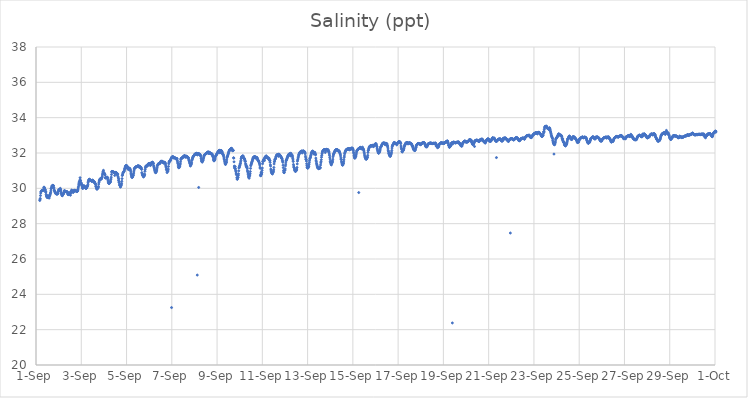
| Category | Salinity (ppt) |
|---|---|
| 44440.166666666664 | 29.31 |
| 44440.177083333336 | 29.37 |
| 44440.1875 | 29.43 |
| 44440.197916666664 | 29.59 |
| 44440.208333333336 | 29.73 |
| 44440.21875 | 29.8 |
| 44440.229166666664 | 29.83 |
| 44440.239583333336 | 29.84 |
| 44440.25 | 29.87 |
| 44440.260416666664 | 29.88 |
| 44440.270833333336 | 29.88 |
| 44440.28125 | 29.88 |
| 44440.291666666664 | 29.88 |
| 44440.302083333336 | 29.88 |
| 44440.3125 | 29.89 |
| 44440.322916666664 | 29.9 |
| 44440.333333333336 | 29.93 |
| 44440.34375 | 30.03 |
| 44440.354166666664 | 30.07 |
| 44440.364583333336 | 30.01 |
| 44440.375 | 30.03 |
| 44440.385416666664 | 29.94 |
| 44440.395833333336 | 29.92 |
| 44440.40625 | 29.93 |
| 44440.416666666664 | 29.85 |
| 44440.427083333336 | 29.78 |
| 44440.4375 | 29.8 |
| 44440.447916666664 | 29.66 |
| 44440.458333333336 | 29.57 |
| 44440.46875 | 29.56 |
| 44440.479166666664 | 29.59 |
| 44440.489583333336 | 29.49 |
| 44440.5 | 29.48 |
| 44440.510416666664 | 29.49 |
| 44440.520833333336 | 29.54 |
| 44440.53125 | 29.58 |
| 44440.541666666664 | 29.54 |
| 44440.552083333336 | 29.5 |
| 44440.5625 | 29.47 |
| 44440.572916666664 | 29.55 |
| 44440.583333333336 | 29.45 |
| 44440.59375 | 29.55 |
| 44440.604166666664 | 29.6 |
| 44440.614583333336 | 29.62 |
| 44440.625 | 29.66 |
| 44440.635416666664 | 29.72 |
| 44440.645833333336 | 29.76 |
| 44440.65625 | 29.85 |
| 44440.666666666664 | 29.97 |
| 44440.677083333336 | 29.99 |
| 44440.6875 | 30.04 |
| 44440.697916666664 | 30.12 |
| 44440.708333333336 | 30.13 |
| 44440.71875 | 30.13 |
| 44440.729166666664 | 30.14 |
| 44440.739583333336 | 30.17 |
| 44440.75 | 30.16 |
| 44440.760416666664 | 30.16 |
| 44440.770833333336 | 30.15 |
| 44440.78125 | 30.06 |
| 44440.791666666664 | 30.02 |
| 44440.802083333336 | 29.9 |
| 44440.8125 | 29.89 |
| 44440.822916666664 | 29.84 |
| 44440.833333333336 | 29.82 |
| 44440.84375 | 29.78 |
| 44440.854166666664 | 29.75 |
| 44440.864583333336 | 29.71 |
| 44440.875 | 29.72 |
| 44440.885416666664 | 29.71 |
| 44440.895833333336 | 29.68 |
| 44440.90625 | 29.69 |
| 44440.916666666664 | 29.68 |
| 44440.927083333336 | 29.72 |
| 44440.9375 | 29.68 |
| 44440.947916666664 | 29.68 |
| 44440.958333333336 | 29.7 |
| 44440.96875 | 29.73 |
| 44440.979166666664 | 29.84 |
| 44440.989583333336 | 29.82 |
| 44441.0 | 29.93 |
| 44441.010416666664 | 29.89 |
| 44441.020833333336 | 29.89 |
| 44441.03125 | 29.92 |
| 44441.041666666664 | 29.91 |
| 44441.052083333336 | 29.88 |
| 44441.0625 | 29.94 |
| 44441.072916666664 | 30 |
| 44441.083333333336 | 29.94 |
| 44441.09375 | 29.91 |
| 44441.104166666664 | 29.81 |
| 44441.114583333336 | 29.73 |
| 44441.125 | 29.69 |
| 44441.135416666664 | 29.67 |
| 44441.145833333336 | 29.61 |
| 44441.15625 | 29.58 |
| 44441.166666666664 | 29.59 |
| 44441.177083333336 | 29.62 |
| 44441.1875 | 29.66 |
| 44441.197916666664 | 29.67 |
| 44441.208333333336 | 29.68 |
| 44441.21875 | 29.71 |
| 44441.229166666664 | 29.75 |
| 44441.239583333336 | 29.77 |
| 44441.25 | 29.87 |
| 44441.260416666664 | 29.83 |
| 44441.270833333336 | 29.86 |
| 44441.28125 | 29.82 |
| 44441.291666666664 | 29.82 |
| 44441.302083333336 | 29.83 |
| 44441.3125 | 29.83 |
| 44441.322916666664 | 29.82 |
| 44441.333333333336 | 29.8 |
| 44441.34375 | 29.81 |
| 44441.354166666664 | 29.79 |
| 44441.364583333336 | 29.79 |
| 44441.375 | 29.81 |
| 44441.385416666664 | 29.8 |
| 44441.395833333336 | 29.76 |
| 44441.40625 | 29.68 |
| 44441.416666666664 | 29.65 |
| 44441.427083333336 | 29.65 |
| 44441.4375 | 29.71 |
| 44441.447916666664 | 29.65 |
| 44441.458333333336 | 29.66 |
| 44441.46875 | 29.67 |
| 44441.479166666664 | 29.7 |
| 44441.489583333336 | 29.76 |
| 44441.5 | 29.66 |
| 44441.510416666664 | 29.71 |
| 44441.520833333336 | 29.61 |
| 44441.53125 | 29.75 |
| 44441.541666666664 | 29.76 |
| 44441.552083333336 | 29.8 |
| 44441.5625 | 29.86 |
| 44441.572916666664 | 29.9 |
| 44441.583333333336 | 29.87 |
| 44441.59375 | 29.85 |
| 44441.604166666664 | 29.85 |
| 44441.614583333336 | 29.82 |
| 44441.625 | 29.81 |
| 44441.635416666664 | 29.78 |
| 44441.645833333336 | 29.77 |
| 44441.65625 | 29.81 |
| 44441.666666666664 | 29.84 |
| 44441.677083333336 | 29.86 |
| 44441.6875 | 29.89 |
| 44441.697916666664 | 29.88 |
| 44441.708333333336 | 29.85 |
| 44441.71875 | 29.88 |
| 44441.729166666664 | 29.88 |
| 44441.739583333336 | 29.87 |
| 44441.75 | 29.85 |
| 44441.760416666664 | 8.81 |
| 44441.770833333336 | 29.86 |
| 44441.78125 | 29.85 |
| 44441.791666666664 | 29.83 |
| 44441.802083333336 | 29.82 |
| 44441.8125 | 29.83 |
| 44441.822916666664 | 29.83 |
| 44441.833333333336 | 29.84 |
| 44441.84375 | 29.88 |
| 44441.854166666664 | 29.94 |
| 44441.864583333336 | 30.02 |
| 44441.875 | 30.09 |
| 44441.885416666664 | 30.19 |
| 44441.895833333336 | 30.26 |
| 44441.90625 | 30.34 |
| 44441.916666666664 | 30.39 |
| 44441.927083333336 | 30.21 |
| 44441.9375 | 30.47 |
| 44441.947916666664 | 30.6 |
| 44441.958333333336 | 30.44 |
| 44441.96875 | 30.44 |
| 44441.979166666664 | 30.33 |
| 44441.989583333336 | 30.28 |
| 44442.0 | 30.3 |
| 44442.010416666664 | 30.23 |
| 44442.020833333336 | 30.21 |
| 44442.03125 | 30.16 |
| 44442.041666666664 | 30.11 |
| 44442.052083333336 | 30.04 |
| 44442.0625 | 29.99 |
| 44442.072916666664 | 30.01 |
| 44442.083333333336 | 30.04 |
| 44442.09375 | 30.12 |
| 44442.104166666664 | 30.15 |
| 44442.114583333336 | 30.07 |
| 44442.125 | 30.1 |
| 44442.135416666664 | 30.13 |
| 44442.145833333336 | 30.12 |
| 44442.15625 | 30.08 |
| 44442.166666666664 | 30.08 |
| 44442.177083333336 | 30.05 |
| 44442.1875 | 30.03 |
| 44442.197916666664 | 30.01 |
| 44442.208333333336 | 29.99 |
| 44442.21875 | 30.01 |
| 44442.229166666664 | 30.02 |
| 44442.239583333336 | 30.03 |
| 44442.25 | 30.07 |
| 44442.260416666664 | 30.1 |
| 44442.270833333336 | 30.13 |
| 44442.28125 | 30.15 |
| 44442.291666666664 | 30.22 |
| 44442.302083333336 | 30.32 |
| 44442.3125 | 30.39 |
| 44442.322916666664 | 30.44 |
| 44442.333333333336 | 30.47 |
| 44442.34375 | 30.5 |
| 44442.354166666664 | 30.51 |
| 44442.364583333336 | 30.51 |
| 44442.375 | 30.49 |
| 44442.385416666664 | 30.47 |
| 44442.395833333336 | 30.46 |
| 44442.40625 | 30.45 |
| 44442.416666666664 | 30.45 |
| 44442.427083333336 | 30.44 |
| 44442.4375 | 30.44 |
| 44442.447916666664 | 30.42 |
| 44442.458333333336 | 30.4 |
| 44442.46875 | 30.41 |
| 44442.479166666664 | 30.41 |
| 44442.489583333336 | 30.41 |
| 44442.5 | 30.47 |
| 44442.510416666664 | 30.42 |
| 44442.520833333336 | 30.42 |
| 44442.53125 | 30.42 |
| 44442.541666666664 | 30.42 |
| 44442.552083333336 | 30.39 |
| 44442.5625 | 30.34 |
| 44442.572916666664 | 30.37 |
| 44442.583333333336 | 30.36 |
| 44442.59375 | 30.33 |
| 44442.604166666664 | 30.28 |
| 44442.614583333336 | 30.27 |
| 44442.625 | 30.26 |
| 44442.635416666664 | 30.2 |
| 44442.645833333336 | 30.11 |
| 44442.65625 | 30.1 |
| 44442.666666666664 | 30.04 |
| 44442.677083333336 | 30 |
| 44442.6875 | 29.96 |
| 44442.697916666664 | 29.95 |
| 44442.708333333336 | 29.99 |
| 44442.71875 | 30.03 |
| 44442.729166666664 | 30.01 |
| 44442.739583333336 | 30.02 |
| 44442.75 | 30.06 |
| 44442.760416666664 | 30.11 |
| 44442.770833333336 | 30.24 |
| 44442.78125 | 30.33 |
| 44442.791666666664 | 30.41 |
| 44442.802083333336 | 30.45 |
| 44442.8125 | 30.47 |
| 44442.822916666664 | 30.49 |
| 44442.833333333336 | 30.54 |
| 44442.84375 | 30.53 |
| 44442.854166666664 | 30.54 |
| 44442.864583333336 | 30.53 |
| 44442.875 | 30.52 |
| 44442.885416666664 | 30.54 |
| 44442.895833333336 | 30.55 |
| 44442.90625 | 30.59 |
| 44442.916666666664 | 30.62 |
| 44442.927083333336 | 30.69 |
| 44442.9375 | 30.78 |
| 44442.947916666664 | 30.85 |
| 44442.958333333336 | 30.92 |
| 44442.96875 | 30.96 |
| 44442.979166666664 | 31.02 |
| 44442.989583333336 | 30.86 |
| 44443.0 | 30.87 |
| 44443.010416666664 | 30.86 |
| 44443.020833333336 | 30.83 |
| 44443.03125 | 30.83 |
| 44443.041666666664 | 30.78 |
| 44443.052083333336 | 30.75 |
| 44443.0625 | 30.6 |
| 44443.072916666664 | 30.58 |
| 44443.083333333336 | 30.62 |
| 44443.09375 | 30.61 |
| 44443.104166666664 | 30.59 |
| 44443.114583333336 | 30.61 |
| 44443.125 | 30.59 |
| 44443.135416666664 | 30.61 |
| 44443.145833333336 | 30.6 |
| 44443.15625 | 30.63 |
| 44443.166666666664 | 30.57 |
| 44443.177083333336 | 30.47 |
| 44443.1875 | 30.41 |
| 44443.197916666664 | 30.34 |
| 44443.208333333336 | 30.3 |
| 44443.21875 | 30.29 |
| 44443.229166666664 | 30.27 |
| 44443.239583333336 | 30.28 |
| 44443.25 | 30.33 |
| 44443.260416666664 | 30.38 |
| 44443.270833333336 | 30.34 |
| 44443.28125 | 30.35 |
| 44443.291666666664 | 30.38 |
| 44443.302083333336 | 30.48 |
| 44443.3125 | 30.53 |
| 44443.322916666664 | 30.63 |
| 44443.333333333336 | 30.78 |
| 44443.34375 | 30.92 |
| 44443.354166666664 | 30.96 |
| 44443.364583333336 | 30.95 |
| 44443.375 | 30.95 |
| 44443.385416666664 | 30.94 |
| 44443.395833333336 | 30.93 |
| 44443.40625 | 30.93 |
| 44443.416666666664 | 30.92 |
| 44443.427083333336 | 30.92 |
| 44443.4375 | 30.91 |
| 44443.447916666664 | 30.9 |
| 44443.458333333336 | 30.9 |
| 44443.46875 | 30.89 |
| 44443.479166666664 | 30.73 |
| 44443.489583333336 | 30.85 |
| 44443.5 | 30.86 |
| 44443.510416666664 | 30.89 |
| 44443.520833333336 | 30.87 |
| 44443.53125 | 30.91 |
| 44443.541666666664 | 30.89 |
| 44443.552083333336 | 30.86 |
| 44443.5625 | 30.86 |
| 44443.572916666664 | 30.83 |
| 44443.583333333336 | 30.82 |
| 44443.59375 | 30.76 |
| 44443.604166666664 | 30.77 |
| 44443.614583333336 | 30.81 |
| 44443.625 | 30.66 |
| 44443.635416666664 | 30.59 |
| 44443.645833333336 | 30.45 |
| 44443.65625 | 30.53 |
| 44443.666666666664 | 30.34 |
| 44443.677083333336 | 30.37 |
| 44443.6875 | 30.24 |
| 44443.697916666664 | 30.16 |
| 44443.708333333336 | 30.19 |
| 44443.71875 | 30.17 |
| 44443.729166666664 | 30.07 |
| 44443.739583333336 | 30.1 |
| 44443.75 | 30.16 |
| 44443.760416666664 | 30.16 |
| 44443.770833333336 | 30.22 |
| 44443.78125 | 30.28 |
| 44443.791666666664 | 30.4 |
| 44443.802083333336 | 30.55 |
| 44443.8125 | 30.72 |
| 44443.822916666664 | 30.76 |
| 44443.833333333336 | 30.82 |
| 44443.84375 | 30.87 |
| 44443.854166666664 | 30.9 |
| 44443.864583333336 | 30.92 |
| 44443.875 | 30.94 |
| 44443.885416666664 | 30.94 |
| 44443.895833333336 | 30.98 |
| 44443.90625 | 31.03 |
| 44443.916666666664 | 31.1 |
| 44443.927083333336 | 31.12 |
| 44443.9375 | 31.17 |
| 44443.947916666664 | 31.22 |
| 44443.958333333336 | 31.26 |
| 44443.96875 | 31.27 |
| 44443.979166666664 | 31.29 |
| 44443.989583333336 | 31.28 |
| 44444.0 | 31.29 |
| 44444.010416666664 | 31.28 |
| 44444.020833333336 | 31.15 |
| 44444.03125 | 31.19 |
| 44444.041666666664 | 31.13 |
| 44444.052083333336 | 31.17 |
| 44444.0625 | 31.2 |
| 44444.072916666664 | 31.17 |
| 44444.083333333336 | 31.06 |
| 44444.09375 | 31.11 |
| 44444.104166666664 | 31.1 |
| 44444.114583333336 | 31.1 |
| 44444.125 | 31.12 |
| 44444.135416666664 | 31.14 |
| 44444.145833333336 | 31.09 |
| 44444.15625 | 31.1 |
| 44444.166666666664 | 31.06 |
| 44444.177083333336 | 31 |
| 44444.1875 | 30.93 |
| 44444.197916666664 | 30.83 |
| 44444.208333333336 | 30.77 |
| 44444.21875 | 30.71 |
| 44444.229166666664 | 30.66 |
| 44444.239583333336 | 30.62 |
| 44444.25 | 30.62 |
| 44444.260416666664 | 30.63 |
| 44444.270833333336 | 30.68 |
| 44444.28125 | 30.74 |
| 44444.291666666664 | 30.72 |
| 44444.302083333336 | 30.76 |
| 44444.3125 | 30.85 |
| 44444.322916666664 | 30.93 |
| 44444.333333333336 | 31.03 |
| 44444.34375 | 31.11 |
| 44444.354166666664 | 31.13 |
| 44444.364583333336 | 31.14 |
| 44444.375 | 31.16 |
| 44444.385416666664 | 31.18 |
| 44444.395833333336 | 31.19 |
| 44444.40625 | 31.21 |
| 44444.416666666664 | 31.21 |
| 44444.427083333336 | 31.22 |
| 44444.4375 | 31.23 |
| 44444.447916666664 | 31.23 |
| 44444.458333333336 | 31.23 |
| 44444.46875 | 31.24 |
| 44444.479166666664 | 31.25 |
| 44444.489583333336 | 31.25 |
| 44444.5 | 31.27 |
| 44444.510416666664 | 31.28 |
| 44444.520833333336 | 31.26 |
| 44444.53125 | 31.26 |
| 44444.541666666664 | 31.21 |
| 44444.552083333336 | 31.23 |
| 44444.5625 | 31.26 |
| 44444.572916666664 | 31.21 |
| 44444.583333333336 | 31.21 |
| 44444.59375 | 31.24 |
| 44444.604166666664 | 31.19 |
| 44444.614583333336 | 31.15 |
| 44444.625 | 31.19 |
| 44444.635416666664 | 31.19 |
| 44444.645833333336 | 31.16 |
| 44444.65625 | 31.11 |
| 44444.666666666664 | 31.07 |
| 44444.677083333336 | 30.89 |
| 44444.6875 | 30.82 |
| 44444.697916666664 | 30.81 |
| 44444.708333333336 | 30.74 |
| 44444.71875 | 30.74 |
| 44444.729166666664 | 30.7 |
| 44444.739583333336 | 30.69 |
| 44444.75 | 30.64 |
| 44444.760416666664 | 30.72 |
| 44444.770833333336 | 30.77 |
| 44444.78125 | 30.7 |
| 44444.791666666664 | 30.72 |
| 44444.802083333336 | 30.8 |
| 44444.8125 | 30.96 |
| 44444.822916666664 | 31.06 |
| 44444.833333333336 | 31.16 |
| 44444.84375 | 31.21 |
| 44444.854166666664 | 31.25 |
| 44444.864583333336 | 31.27 |
| 44444.875 | 31.26 |
| 44444.885416666664 | 31.27 |
| 44444.895833333336 | 31.25 |
| 44444.90625 | 31.27 |
| 44444.916666666664 | 31.27 |
| 44444.927083333336 | 31.29 |
| 44444.9375 | 31.32 |
| 44444.947916666664 | 31.35 |
| 44444.958333333336 | 31.38 |
| 44444.96875 | 31.39 |
| 44444.979166666664 | 31.39 |
| 44444.989583333336 | 31.39 |
| 44445.0 | 31.39 |
| 44445.010416666664 | 31.39 |
| 44445.020833333336 | 31.4 |
| 44445.03125 | 31.41 |
| 44445.041666666664 | 31.36 |
| 44445.052083333336 | 31.29 |
| 44445.0625 | 31.34 |
| 44445.072916666664 | 31.34 |
| 44445.083333333336 | 31.4 |
| 44445.09375 | 31.45 |
| 44445.104166666664 | 31.45 |
| 44445.114583333336 | 31.46 |
| 44445.125 | 31.46 |
| 44445.135416666664 | 31.47 |
| 44445.145833333336 | 31.48 |
| 44445.15625 | 31.46 |
| 44445.166666666664 | 31.45 |
| 44445.177083333336 | 31.4 |
| 44445.1875 | 31.39 |
| 44445.197916666664 | 31.28 |
| 44445.208333333336 | 31.24 |
| 44445.21875 | 31.17 |
| 44445.229166666664 | 31.14 |
| 44445.239583333336 | 31.06 |
| 44445.25 | 31.01 |
| 44445.260416666664 | 30.96 |
| 44445.270833333336 | 30.91 |
| 44445.28125 | 30.89 |
| 44445.291666666664 | 30.89 |
| 44445.302083333336 | 30.91 |
| 44445.3125 | 30.99 |
| 44445.322916666664 | 30.97 |
| 44445.333333333336 | 31.03 |
| 44445.34375 | 31.1 |
| 44445.354166666664 | 31.2 |
| 44445.364583333336 | 31.29 |
| 44445.375 | 31.31 |
| 44445.385416666664 | 31.33 |
| 44445.395833333336 | 31.37 |
| 44445.40625 | 31.38 |
| 44445.416666666664 | 31.4 |
| 44445.427083333336 | 31.4 |
| 44445.4375 | 31.4 |
| 44445.447916666664 | 31.4 |
| 44445.458333333336 | 31.4 |
| 44445.46875 | 31.41 |
| 44445.479166666664 | 31.43 |
| 44445.489583333336 | 31.46 |
| 44445.5 | 31.48 |
| 44445.510416666664 | 31.51 |
| 44445.520833333336 | 31.53 |
| 44445.53125 | 31.54 |
| 44445.541666666664 | 31.52 |
| 44445.552083333336 | 31.51 |
| 44445.5625 | 31.49 |
| 44445.572916666664 | 31.53 |
| 44445.583333333336 | 31.52 |
| 44445.59375 | 31.52 |
| 44445.604166666664 | 31.49 |
| 44445.614583333336 | 31.46 |
| 44445.625 | 31.46 |
| 44445.635416666664 | 31.46 |
| 44445.645833333336 | 31.43 |
| 44445.65625 | 31.43 |
| 44445.666666666664 | 31.45 |
| 44445.677083333336 | 31.47 |
| 44445.6875 | 31.47 |
| 44445.697916666664 | 31.45 |
| 44445.708333333336 | 31.43 |
| 44445.71875 | 31.39 |
| 44445.729166666664 | 31.31 |
| 44445.739583333336 | 31.24 |
| 44445.75 | 31.19 |
| 44445.760416666664 | 31.07 |
| 44445.770833333336 | 31.1 |
| 44445.78125 | 30.99 |
| 44445.791666666664 | 30.89 |
| 44445.802083333336 | 31 |
| 44445.8125 | 30.97 |
| 44445.822916666664 | 30.96 |
| 44445.833333333336 | 31.03 |
| 44445.84375 | 31.09 |
| 44445.854166666664 | 31.24 |
| 44445.864583333336 | 31.39 |
| 44445.875 | 31.47 |
| 44445.885416666664 | 31.5 |
| 44445.895833333336 | 31.52 |
| 44445.90625 | 31.54 |
| 44445.916666666664 | 31.57 |
| 44445.927083333336 | 31.57 |
| 44445.9375 | 31.57 |
| 44445.947916666664 | 31.59 |
| 44445.958333333336 | 31.65 |
| 44445.96875 | 31.69 |
| 44445.979166666664 | 31.72 |
| 44445.989583333336 | 23.25 |
| 44446.0 | 31.76 |
| 44446.010416666664 | 31.77 |
| 44446.020833333336 | 31.78 |
| 44446.03125 | 31.78 |
| 44446.041666666664 | 31.79 |
| 44446.052083333336 | 31.78 |
| 44446.0625 | 31.79 |
| 44446.072916666664 | 31.73 |
| 44446.083333333336 | 31.73 |
| 44446.09375 | 31.75 |
| 44446.104166666664 | 31.75 |
| 44446.114583333336 | 31.74 |
| 44446.125 | 31.74 |
| 44446.135416666664 | 31.72 |
| 44446.145833333336 | 31.72 |
| 44446.15625 | 31.7 |
| 44446.166666666664 | 31.69 |
| 44446.177083333336 | 31.69 |
| 44446.1875 | 31.67 |
| 44446.197916666664 | 31.66 |
| 44446.208333333336 | 31.69 |
| 44446.21875 | 31.68 |
| 44446.229166666664 | 31.69 |
| 44446.239583333336 | 31.6 |
| 44446.25 | 31.54 |
| 44446.260416666664 | 31.45 |
| 44446.270833333336 | 31.4 |
| 44446.28125 | 31.32 |
| 44446.291666666664 | 31.23 |
| 44446.302083333336 | 31.17 |
| 44446.3125 | 31.17 |
| 44446.322916666664 | 31.17 |
| 44446.333333333336 | 31.3 |
| 44446.34375 | 31.23 |
| 44446.354166666664 | 31.26 |
| 44446.364583333336 | 31.33 |
| 44446.375 | 31.39 |
| 44446.385416666664 | 31.5 |
| 44446.395833333336 | 31.62 |
| 44446.40625 | 31.67 |
| 44446.416666666664 | 31.69 |
| 44446.427083333336 | 31.7 |
| 44446.4375 | 31.71 |
| 44446.447916666664 | 31.72 |
| 44446.458333333336 | 31.73 |
| 44446.46875 | 31.73 |
| 44446.479166666664 | 31.74 |
| 44446.489583333336 | 31.76 |
| 44446.5 | 31.78 |
| 44446.510416666664 | 31.8 |
| 44446.520833333336 | 31.81 |
| 44446.53125 | 31.82 |
| 44446.541666666664 | 31.83 |
| 44446.552083333336 | 31.83 |
| 44446.5625 | 31.84 |
| 44446.572916666664 | 31.84 |
| 44446.583333333336 | 31.84 |
| 44446.59375 | 31.76 |
| 44446.604166666664 | 31.79 |
| 44446.614583333336 | 31.81 |
| 44446.625 | 31.8 |
| 44446.635416666664 | 31.82 |
| 44446.645833333336 | 31.81 |
| 44446.65625 | 31.77 |
| 44446.666666666664 | 31.8 |
| 44446.677083333336 | 31.77 |
| 44446.6875 | 31.78 |
| 44446.697916666664 | 31.77 |
| 44446.708333333336 | 31.74 |
| 44446.71875 | 31.74 |
| 44446.729166666664 | 31.74 |
| 44446.739583333336 | 31.7 |
| 44446.75 | 31.62 |
| 44446.760416666664 | 31.58 |
| 44446.770833333336 | 31.54 |
| 44446.78125 | 31.49 |
| 44446.791666666664 | 31.43 |
| 44446.802083333336 | 31.39 |
| 44446.8125 | 31.32 |
| 44446.822916666664 | 31.26 |
| 44446.833333333336 | 31.33 |
| 44446.84375 | 31.4 |
| 44446.854166666664 | 31.33 |
| 44446.864583333336 | 31.38 |
| 44446.875 | 31.45 |
| 44446.885416666664 | 31.57 |
| 44446.895833333336 | 31.63 |
| 44446.90625 | 31.66 |
| 44446.916666666664 | 31.71 |
| 44446.927083333336 | 31.74 |
| 44446.9375 | 31.78 |
| 44446.947916666664 | 31.8 |
| 44446.958333333336 | 31.82 |
| 44446.96875 | 31.84 |
| 44446.979166666664 | 31.86 |
| 44446.989583333336 | 31.87 |
| 44447.0 | 31.87 |
| 44447.010416666664 | 31.93 |
| 44447.020833333336 | 31.93 |
| 44447.03125 | 31.93 |
| 44447.041666666664 | 31.94 |
| 44447.052083333336 | 31.95 |
| 44447.0625 | 31.95 |
| 44447.072916666664 | 31.97 |
| 44447.083333333336 | 31.98 |
| 44447.09375 | 31.98 |
| 44447.104166666664 | 31.93 |
| 44447.114583333336 | 31.92 |
| 44447.125 | 25.09 |
| 44447.135416666664 | 31.89 |
| 44447.145833333336 | 31.95 |
| 44447.15625 | 31.98 |
| 44447.166666666664 | 31.97 |
| 44447.177083333336 | 31.96 |
| 44447.1875 | 30.05 |
| 44447.197916666664 | 31.94 |
| 44447.208333333336 | 31.96 |
| 44447.21875 | 31.92 |
| 44447.229166666664 | 31.91 |
| 44447.239583333336 | 31.93 |
| 44447.25 | 31.91 |
| 44447.260416666664 | 31.87 |
| 44447.270833333336 | 31.85 |
| 44447.28125 | 31.82 |
| 44447.291666666664 | 31.71 |
| 44447.302083333336 | 31.66 |
| 44447.3125 | 31.57 |
| 44447.322916666664 | 31.53 |
| 44447.333333333336 | 31.52 |
| 44447.34375 | 31.48 |
| 44447.354166666664 | 31.56 |
| 44447.364583333336 | 31.58 |
| 44447.375 | 31.56 |
| 44447.385416666664 | 31.61 |
| 44447.395833333336 | 31.68 |
| 44447.40625 | 31.74 |
| 44447.416666666664 | 31.8 |
| 44447.427083333336 | 31.85 |
| 44447.4375 | 31.87 |
| 44447.447916666664 | 31.9 |
| 44447.458333333336 | 31.91 |
| 44447.46875 | 31.92 |
| 44447.479166666664 | 31.93 |
| 44447.489583333336 | 31.94 |
| 44447.5 | 31.95 |
| 44447.510416666664 | 31.96 |
| 44447.520833333336 | 31.98 |
| 44447.53125 | 31.99 |
| 44447.541666666664 | 32 |
| 44447.552083333336 | 32.01 |
| 44447.5625 | 32.01 |
| 44447.572916666664 | 32.02 |
| 44447.583333333336 | 32.02 |
| 44447.59375 | 32.06 |
| 44447.604166666664 | 32.06 |
| 44447.614583333336 | 32.05 |
| 44447.625 | 31.98 |
| 44447.635416666664 | 31.98 |
| 44447.645833333336 | 32.03 |
| 44447.65625 | 32.04 |
| 44447.666666666664 | 32.01 |
| 44447.677083333336 | 32 |
| 44447.6875 | 31.98 |
| 44447.697916666664 | 32.02 |
| 44447.708333333336 | 31.97 |
| 44447.71875 | 31.97 |
| 44447.729166666664 | 31.97 |
| 44447.739583333336 | 31.94 |
| 44447.75 | 31.95 |
| 44447.760416666664 | 31.96 |
| 44447.770833333336 | 31.95 |
| 44447.78125 | 31.93 |
| 44447.791666666664 | 31.9 |
| 44447.802083333336 | 31.85 |
| 44447.8125 | 31.8 |
| 44447.822916666664 | 31.78 |
| 44447.833333333336 | 31.72 |
| 44447.84375 | 31.62 |
| 44447.854166666664 | 31.6 |
| 44447.864583333336 | 31.55 |
| 44447.875 | 31.6 |
| 44447.885416666664 | 31.6 |
| 44447.895833333336 | 31.6 |
| 44447.90625 | 31.64 |
| 44447.916666666664 | 31.71 |
| 44447.927083333336 | 31.79 |
| 44447.9375 | 31.83 |
| 44447.947916666664 | 31.85 |
| 44447.958333333336 | 31.88 |
| 44447.96875 | 31.9 |
| 44447.979166666664 | 31.92 |
| 44447.989583333336 | 31.94 |
| 44448.0 | 31.96 |
| 44448.010416666664 | 31.98 |
| 44448.020833333336 | 32.01 |
| 44448.03125 | 32.04 |
| 44448.041666666664 | 32.07 |
| 44448.052083333336 | 32.08 |
| 44448.0625 | 32.1 |
| 44448.072916666664 | 32.13 |
| 44448.083333333336 | 32.12 |
| 44448.09375 | 32.15 |
| 44448.104166666664 | 32.14 |
| 44448.114583333336 | 32.15 |
| 44448.125 | 32.01 |
| 44448.135416666664 | 32.06 |
| 44448.145833333336 | 32.04 |
| 44448.15625 | 32.12 |
| 44448.166666666664 | 32.14 |
| 44448.177083333336 | 32.14 |
| 44448.1875 | 32.12 |
| 44448.197916666664 | 32.13 |
| 44448.208333333336 | 32.1 |
| 44448.21875 | 32.07 |
| 44448.229166666664 | 32.03 |
| 44448.239583333336 | 31.96 |
| 44448.25 | 31.95 |
| 44448.260416666664 | 31.92 |
| 44448.270833333336 | 31.89 |
| 44448.28125 | 31.87 |
| 44448.291666666664 | 31.8 |
| 44448.302083333336 | 31.72 |
| 44448.3125 | 31.66 |
| 44448.322916666664 | 31.62 |
| 44448.333333333336 | 31.54 |
| 44448.34375 | 31.48 |
| 44448.354166666664 | 31.41 |
| 44448.364583333336 | 31.37 |
| 44448.375 | 31.35 |
| 44448.385416666664 | 31.42 |
| 44448.395833333336 | 31.46 |
| 44448.40625 | 31.45 |
| 44448.416666666664 | 31.5 |
| 44448.427083333336 | 31.61 |
| 44448.4375 | 31.73 |
| 44448.447916666664 | 31.78 |
| 44448.458333333336 | 31.81 |
| 44448.46875 | 31.84 |
| 44448.479166666664 | 31.89 |
| 44448.489583333336 | 31.93 |
| 44448.5 | 31.98 |
| 44448.510416666664 | 32.02 |
| 44448.520833333336 | 32.07 |
| 44448.53125 | 32.1 |
| 44448.541666666664 | 32.13 |
| 44448.552083333336 | 32.16 |
| 44448.5625 | 32.18 |
| 44448.572916666664 | 32.19 |
| 44448.583333333336 | 32.2 |
| 44448.59375 | 32.22 |
| 44448.604166666664 | 32.23 |
| 44448.614583333336 | 32.25 |
| 44448.625 | 32.26 |
| 44448.635416666664 | 32.26 |
| 44448.645833333336 | 32.26 |
| 44448.65625 | 32.23 |
| 44448.666666666664 | 32.15 |
| 44448.677083333336 | 32.16 |
| 44448.6875 | 32.13 |
| 44448.697916666664 | 32.14 |
| 44448.708333333336 | 32.16 |
| 44448.71875 | 32.14 |
| 44448.729166666664 | 31.73 |
| 44448.739583333336 | 31.71 |
| 44448.75 | 31.5 |
| 44448.760416666664 | 31.26 |
| 44448.770833333336 | 31.2 |
| 44448.78125 | 31.14 |
| 44448.791666666664 | 31.14 |
| 44448.802083333336 | 31.23 |
| 44448.8125 | 31.1 |
| 44448.822916666664 | 31 |
| 44448.833333333336 | 30.94 |
| 44448.84375 | 30.86 |
| 44448.854166666664 | 30.79 |
| 44448.864583333336 | 30.76 |
| 44448.875 | 30.61 |
| 44448.885416666664 | 30.53 |
| 44448.895833333336 | 30.51 |
| 44448.90625 | 30.59 |
| 44448.916666666664 | 30.61 |
| 44448.927083333336 | 30.63 |
| 44448.9375 | 30.73 |
| 44448.947916666664 | 30.82 |
| 44448.958333333336 | 30.99 |
| 44448.96875 | 31.15 |
| 44448.979166666664 | 31.18 |
| 44448.989583333336 | 31.23 |
| 44449.0 | 31.29 |
| 44449.010416666664 | 31.32 |
| 44449.020833333336 | 31.38 |
| 44449.03125 | 31.41 |
| 44449.041666666664 | 31.5 |
| 44449.052083333336 | 31.58 |
| 44449.0625 | 31.68 |
| 44449.072916666664 | 31.72 |
| 44449.083333333336 | 31.77 |
| 44449.09375 | 31.8 |
| 44449.104166666664 | 31.8 |
| 44449.114583333336 | 31.82 |
| 44449.125 | 31.82 |
| 44449.135416666664 | 31.82 |
| 44449.145833333336 | 31.83 |
| 44449.15625 | 31.82 |
| 44449.166666666664 | 31.74 |
| 44449.177083333336 | 31.73 |
| 44449.1875 | 31.7 |
| 44449.197916666664 | 31.68 |
| 44449.208333333336 | 31.68 |
| 44449.21875 | 31.63 |
| 44449.229166666664 | 31.58 |
| 44449.239583333336 | 31.53 |
| 44449.25 | 31.52 |
| 44449.260416666664 | 31.4 |
| 44449.270833333336 | 31.34 |
| 44449.28125 | 31.29 |
| 44449.291666666664 | 31.23 |
| 44449.302083333336 | 31.22 |
| 44449.3125 | 31.24 |
| 44449.322916666664 | 31.18 |
| 44449.333333333336 | 31.11 |
| 44449.34375 | 31 |
| 44449.354166666664 | 30.94 |
| 44449.364583333336 | 30.87 |
| 44449.375 | 30.79 |
| 44449.385416666664 | 30.7 |
| 44449.395833333336 | 30.64 |
| 44449.40625 | 30.62 |
| 44449.416666666664 | 30.57 |
| 44449.427083333336 | 30.75 |
| 44449.4375 | 30.69 |
| 44449.447916666664 | 30.75 |
| 44449.458333333336 | 30.83 |
| 44449.46875 | 30.95 |
| 44449.479166666664 | 31.13 |
| 44449.489583333336 | 31.28 |
| 44449.5 | 31.33 |
| 44449.510416666664 | 31.37 |
| 44449.520833333336 | 31.42 |
| 44449.53125 | 31.46 |
| 44449.541666666664 | 31.51 |
| 44449.552083333336 | 31.54 |
| 44449.5625 | 31.59 |
| 44449.572916666664 | 31.64 |
| 44449.583333333336 | 31.69 |
| 44449.59375 | 31.72 |
| 44449.604166666664 | 31.74 |
| 44449.614583333336 | 31.76 |
| 44449.625 | 31.77 |
| 44449.635416666664 | 31.78 |
| 44449.645833333336 | 31.78 |
| 44449.65625 | 31.79 |
| 44449.666666666664 | 31.79 |
| 44449.677083333336 | 31.8 |
| 44449.6875 | 31.71 |
| 44449.697916666664 | 31.73 |
| 44449.708333333336 | 31.76 |
| 44449.71875 | 31.75 |
| 44449.729166666664 | 31.75 |
| 44449.739583333336 | 31.75 |
| 44449.75 | 31.73 |
| 44449.760416666664 | 31.75 |
| 44449.770833333336 | 31.72 |
| 44449.78125 | 31.68 |
| 44449.791666666664 | 31.64 |
| 44449.802083333336 | 31.59 |
| 44449.8125 | 31.59 |
| 44449.822916666664 | 31.56 |
| 44449.833333333336 | 31.54 |
| 44449.84375 | 31.55 |
| 44449.854166666664 | 31.49 |
| 44449.864583333336 | 31.45 |
| 44449.875 | 31.39 |
| 44449.885416666664 | 31.32 |
| 44449.895833333336 | 31.2 |
| 44449.90625 | 31.13 |
| 44449.916666666664 | 30.72 |
| 44449.927083333336 | 30.78 |
| 44449.9375 | 30.71 |
| 44449.947916666664 | 30.91 |
| 44449.958333333336 | 30.84 |
| 44449.96875 | 30.8 |
| 44449.979166666664 | 30.89 |
| 44449.989583333336 | 31.02 |
| 44450.0 | 31.15 |
| 44450.010416666664 | 31.39 |
| 44450.020833333336 | 31.51 |
| 44450.03125 | 31.53 |
| 44450.041666666664 | 31.58 |
| 44450.052083333336 | 31.6 |
| 44450.0625 | 31.62 |
| 44450.072916666664 | 31.65 |
| 44450.083333333336 | 31.67 |
| 44450.09375 | 31.57 |
| 44450.104166666664 | 31.71 |
| 44450.114583333336 | 31.75 |
| 44450.125 | 31.77 |
| 44450.135416666664 | 31.78 |
| 44450.145833333336 | 31.8 |
| 44450.15625 | 31.81 |
| 44450.166666666664 | 31.83 |
| 44450.177083333336 | 31.83 |
| 44450.1875 | 31.76 |
| 44450.197916666664 | 31.75 |
| 44450.208333333336 | 31.76 |
| 44450.21875 | 31.76 |
| 44450.229166666664 | 31.74 |
| 44450.239583333336 | 31.73 |
| 44450.25 | 31.69 |
| 44450.260416666664 | 31.72 |
| 44450.270833333336 | 31.71 |
| 44450.28125 | 31.68 |
| 44450.291666666664 | 31.71 |
| 44450.302083333336 | 31.66 |
| 44450.3125 | 31.59 |
| 44450.322916666664 | 31.58 |
| 44450.333333333336 | 31.57 |
| 44450.34375 | 31.47 |
| 44450.354166666664 | 31.33 |
| 44450.364583333336 | 31.26 |
| 44450.375 | 31.09 |
| 44450.385416666664 | 31.03 |
| 44450.395833333336 | 30.95 |
| 44450.40625 | 30.91 |
| 44450.416666666664 | 30.87 |
| 44450.427083333336 | 30.85 |
| 44450.4375 | 30.82 |
| 44450.447916666664 | 30.82 |
| 44450.458333333336 | 30.91 |
| 44450.46875 | 30.88 |
| 44450.479166666664 | 30.92 |
| 44450.489583333336 | 30.97 |
| 44450.5 | 31.05 |
| 44450.510416666664 | 31.18 |
| 44450.520833333336 | 31.38 |
| 44450.53125 | 31.5 |
| 44450.541666666664 | 31.54 |
| 44450.552083333336 | 31.62 |
| 44450.5625 | 31.65 |
| 44450.572916666664 | 31.67 |
| 44450.583333333336 | 31.69 |
| 44450.59375 | 31.72 |
| 44450.604166666664 | 31.8 |
| 44450.614583333336 | 31.8 |
| 44450.625 | 31.86 |
| 44450.635416666664 | 31.88 |
| 44450.645833333336 | 31.88 |
| 44450.65625 | 31.9 |
| 44450.666666666664 | 31.91 |
| 44450.677083333336 | 31.91 |
| 44450.6875 | 31.91 |
| 44450.697916666664 | 31.92 |
| 44450.708333333336 | 31.93 |
| 44450.71875 | 31.81 |
| 44450.729166666664 | 31.85 |
| 44450.739583333336 | 31.92 |
| 44450.75 | 31.92 |
| 44450.760416666664 | 31.9 |
| 44450.770833333336 | 31.86 |
| 44450.78125 | 31.87 |
| 44450.791666666664 | 31.84 |
| 44450.802083333336 | 31.83 |
| 44450.8125 | 31.81 |
| 44450.822916666664 | 31.8 |
| 44450.833333333336 | 31.74 |
| 44450.84375 | 31.74 |
| 44450.854166666664 | 31.71 |
| 44450.864583333336 | 31.7 |
| 44450.875 | 31.66 |
| 44450.885416666664 | 31.59 |
| 44450.895833333336 | 31.53 |
| 44450.90625 | 31.47 |
| 44450.916666666664 | 31.31 |
| 44450.927083333336 | 31.17 |
| 44450.9375 | 31.01 |
| 44450.947916666664 | 30.93 |
| 44450.958333333336 | 30.89 |
| 44450.96875 | 30.89 |
| 44450.979166666664 | 31 |
| 44450.989583333336 | 31.03 |
| 44451.0 | 31.03 |
| 44451.010416666664 | 31.1 |
| 44451.020833333336 | 31.27 |
| 44451.03125 | 31.37 |
| 44451.041666666664 | 31.49 |
| 44451.052083333336 | 31.59 |
| 44451.0625 | 31.58 |
| 44451.072916666664 | 31.63 |
| 44451.083333333336 | 31.66 |
| 44451.09375 | 31.7 |
| 44451.104166666664 | 31.74 |
| 44451.114583333336 | 31.77 |
| 44451.125 | 31.82 |
| 44451.135416666664 | 31.85 |
| 44451.145833333336 | 31.88 |
| 44451.15625 | 31.9 |
| 44451.166666666664 | 31.91 |
| 44451.177083333336 | 31.93 |
| 44451.1875 | 31.94 |
| 44451.197916666664 | 31.94 |
| 44451.208333333336 | 31.96 |
| 44451.21875 | 31.91 |
| 44451.229166666664 | 31.89 |
| 44451.239583333336 | 31.84 |
| 44451.25 | 31.86 |
| 44451.260416666664 | 31.99 |
| 44451.270833333336 | 31.93 |
| 44451.28125 | 31.9 |
| 44451.291666666664 | 31.91 |
| 44451.302083333336 | 31.89 |
| 44451.3125 | 31.88 |
| 44451.322916666664 | 31.85 |
| 44451.333333333336 | 31.78 |
| 44451.34375 | 31.7 |
| 44451.354166666664 | 31.61 |
| 44451.364583333336 | 31.52 |
| 44451.375 | 31.35 |
| 44451.385416666664 | 31.26 |
| 44451.395833333336 | 31.19 |
| 44451.40625 | 31.17 |
| 44451.416666666664 | 31.1 |
| 44451.427083333336 | 31.04 |
| 44451.4375 | 31.01 |
| 44451.447916666664 | 30.99 |
| 44451.458333333336 | 30.96 |
| 44451.46875 | 30.96 |
| 44451.479166666664 | 31.01 |
| 44451.489583333336 | 31.05 |
| 44451.5 | 31 |
| 44451.510416666664 | 31.04 |
| 44451.520833333336 | 31.09 |
| 44451.53125 | 31.18 |
| 44451.541666666664 | 31.38 |
| 44451.552083333336 | 31.54 |
| 44451.5625 | 31.61 |
| 44451.572916666664 | 31.66 |
| 44451.583333333336 | 31.73 |
| 44451.59375 | 31.8 |
| 44451.604166666664 | 31.88 |
| 44451.614583333336 | 31.9 |
| 44451.625 | 31.94 |
| 44451.635416666664 | 31.97 |
| 44451.645833333336 | 31.99 |
| 44451.65625 | 32.03 |
| 44451.666666666664 | 32.04 |
| 44451.677083333336 | 32.05 |
| 44451.6875 | 32.07 |
| 44451.697916666664 | 32.08 |
| 44451.708333333336 | 32.09 |
| 44451.71875 | 32.1 |
| 44451.729166666664 | 32.1 |
| 44451.739583333336 | 32.1 |
| 44451.75 | 32.07 |
| 44451.760416666664 | 32 |
| 44451.770833333336 | 32.04 |
| 44451.78125 | 32.05 |
| 44451.791666666664 | 32.1 |
| 44451.802083333336 | 32.13 |
| 44451.8125 | 32.09 |
| 44451.822916666664 | 32.1 |
| 44451.833333333336 | 32.08 |
| 44451.84375 | 32.06 |
| 44451.854166666664 | 32.09 |
| 44451.864583333336 | 32.05 |
| 44451.875 | 32.06 |
| 44451.885416666664 | 32.02 |
| 44451.895833333336 | 31.95 |
| 44451.90625 | 31.82 |
| 44451.916666666664 | 31.73 |
| 44451.927083333336 | 31.64 |
| 44451.9375 | 31.63 |
| 44451.947916666664 | 31.54 |
| 44451.958333333336 | 31.39 |
| 44451.96875 | 31.28 |
| 44451.979166666664 | 31.19 |
| 44451.989583333336 | 31.17 |
| 44452.0 | 31.16 |
| 44452.010416666664 | 31.14 |
| 44452.020833333336 | 31.18 |
| 44452.03125 | 31.25 |
| 44452.041666666664 | 31.21 |
| 44452.052083333336 | 31.25 |
| 44452.0625 | 31.35 |
| 44452.072916666664 | 31.45 |
| 44452.083333333336 | 31.56 |
| 44452.09375 | 31.66 |
| 44452.104166666664 | 31.69 |
| 44452.114583333336 | 31.73 |
| 44452.125 | 31.76 |
| 44452.135416666664 | 31.83 |
| 44452.145833333336 | 31.87 |
| 44452.15625 | 31.93 |
| 44452.166666666664 | 31.99 |
| 44452.177083333336 | 32.01 |
| 44452.1875 | 32.05 |
| 44452.197916666664 | 32.07 |
| 44452.208333333336 | 32.09 |
| 44452.21875 | 32.1 |
| 44452.229166666664 | 32.1 |
| 44452.239583333336 | 32.1 |
| 44452.25 | 32.05 |
| 44452.260416666664 | 31.99 |
| 44452.270833333336 | 31.96 |
| 44452.28125 | 31.95 |
| 44452.291666666664 | 31.97 |
| 44452.302083333336 | 32 |
| 44452.3125 | 31.96 |
| 44452.322916666664 | 32.04 |
| 44452.333333333336 | 31.97 |
| 44452.34375 | 31.92 |
| 44452.354166666664 | 31.9 |
| 44452.364583333336 | 31.71 |
| 44452.375 | 31.59 |
| 44452.385416666664 | 31.51 |
| 44452.395833333336 | 31.42 |
| 44452.40625 | 31.36 |
| 44452.416666666664 | 31.3 |
| 44452.427083333336 | 31.25 |
| 44452.4375 | 31.17 |
| 44452.447916666664 | 31.18 |
| 44452.458333333336 | 31.15 |
| 44452.46875 | 31.16 |
| 44452.479166666664 | 31.13 |
| 44452.489583333336 | 31.11 |
| 44452.5 | 31.13 |
| 44452.510416666664 | 31.14 |
| 44452.520833333336 | 31.17 |
| 44452.53125 | 31.15 |
| 44452.541666666664 | 31.14 |
| 44452.552083333336 | 31.15 |
| 44452.5625 | 31.18 |
| 44452.572916666664 | 31.32 |
| 44452.583333333336 | 31.44 |
| 44452.59375 | 31.51 |
| 44452.604166666664 | 31.62 |
| 44452.614583333336 | 31.76 |
| 44452.625 | 31.86 |
| 44452.635416666664 | 31.95 |
| 44452.645833333336 | 32 |
| 44452.65625 | 32.08 |
| 44452.666666666664 | 32.09 |
| 44452.677083333336 | 32.12 |
| 44452.6875 | 32.15 |
| 44452.697916666664 | 32.16 |
| 44452.708333333336 | 32.17 |
| 44452.71875 | 32.18 |
| 44452.729166666664 | 32.18 |
| 44452.739583333336 | 32.18 |
| 44452.75 | 32.18 |
| 44452.760416666664 | 32.19 |
| 44452.770833333336 | 32.18 |
| 44452.78125 | 32.03 |
| 44452.791666666664 | 32.15 |
| 44452.802083333336 | 32.14 |
| 44452.8125 | 32.17 |
| 44452.822916666664 | 32.21 |
| 44452.833333333336 | 32.16 |
| 44452.84375 | 32.19 |
| 44452.854166666664 | 32.21 |
| 44452.864583333336 | 32.17 |
| 44452.875 | 32.19 |
| 44452.885416666664 | 32.18 |
| 44452.895833333336 | 32.18 |
| 44452.90625 | 32.18 |
| 44452.916666666664 | 32.13 |
| 44452.927083333336 | 32.09 |
| 44452.9375 | 32.05 |
| 44452.947916666664 | 32.06 |
| 44452.958333333336 | 31.95 |
| 44452.96875 | 31.87 |
| 44452.979166666664 | 31.76 |
| 44452.989583333336 | 31.66 |
| 44453.0 | 31.53 |
| 44453.010416666664 | 31.46 |
| 44453.020833333336 | 31.47 |
| 44453.03125 | 31.4 |
| 44453.041666666664 | 31.34 |
| 44453.052083333336 | 31.33 |
| 44453.0625 | 31.41 |
| 44453.072916666664 | 31.52 |
| 44453.083333333336 | 31.45 |
| 44453.09375 | 31.48 |
| 44453.104166666664 | 31.55 |
| 44453.114583333336 | 31.65 |
| 44453.125 | 31.79 |
| 44453.135416666664 | 31.88 |
| 44453.145833333336 | 31.92 |
| 44453.15625 | 31.96 |
| 44453.166666666664 | 31.99 |
| 44453.177083333336 | 32.02 |
| 44453.1875 | 32.06 |
| 44453.197916666664 | 32.1 |
| 44453.208333333336 | 32.09 |
| 44453.21875 | 32.15 |
| 44453.229166666664 | 32.16 |
| 44453.239583333336 | 32.17 |
| 44453.25 | 32.18 |
| 44453.260416666664 | 32.18 |
| 44453.270833333336 | 32.15 |
| 44453.28125 | 32.19 |
| 44453.291666666664 | 32.19 |
| 44453.302083333336 | 32.19 |
| 44453.3125 | 32.17 |
| 44453.322916666664 | 32.17 |
| 44453.333333333336 | 32.16 |
| 44453.34375 | 32.15 |
| 44453.354166666664 | 32.15 |
| 44453.364583333336 | 32.14 |
| 44453.375 | 32.08 |
| 44453.385416666664 | 32.08 |
| 44453.395833333336 | 32.12 |
| 44453.40625 | 32.06 |
| 44453.416666666664 | 32.05 |
| 44453.427083333336 | 32 |
| 44453.4375 | 31.96 |
| 44453.447916666664 | 31.91 |
| 44453.458333333336 | 31.83 |
| 44453.46875 | 31.72 |
| 44453.479166666664 | 31.65 |
| 44453.489583333336 | 31.63 |
| 44453.5 | 31.52 |
| 44453.510416666664 | 31.47 |
| 44453.520833333336 | 31.4 |
| 44453.53125 | 31.34 |
| 44453.541666666664 | 31.32 |
| 44453.552083333336 | 31.31 |
| 44453.5625 | 31.36 |
| 44453.572916666664 | 31.41 |
| 44453.583333333336 | 31.41 |
| 44453.59375 | 31.5 |
| 44453.604166666664 | 31.61 |
| 44453.614583333336 | 31.74 |
| 44453.625 | 31.83 |
| 44453.635416666664 | 31.95 |
| 44453.645833333336 | 32 |
| 44453.65625 | 32.04 |
| 44453.666666666664 | 32.09 |
| 44453.677083333336 | 32.11 |
| 44453.6875 | 32.13 |
| 44453.697916666664 | 32.17 |
| 44453.708333333336 | 32.19 |
| 44453.71875 | 32.19 |
| 44453.729166666664 | 32.2 |
| 44453.739583333336 | 32.22 |
| 44453.75 | 32.21 |
| 44453.760416666664 | 32.22 |
| 44453.770833333336 | 32.22 |
| 44453.78125 | 32.24 |
| 44453.791666666664 | 32.23 |
| 44453.802083333336 | 32.24 |
| 44453.8125 | 32.24 |
| 44453.822916666664 | 32.25 |
| 44453.833333333336 | 32.18 |
| 44453.84375 | 32.21 |
| 44453.854166666664 | 32.22 |
| 44453.864583333336 | 32.18 |
| 44453.875 | 32.25 |
| 44453.885416666664 | 32.26 |
| 44453.895833333336 | 32.21 |
| 44453.90625 | 32.25 |
| 44453.916666666664 | 32.25 |
| 44453.927083333336 | 32.24 |
| 44453.9375 | 32.25 |
| 44453.947916666664 | 32.29 |
| 44453.958333333336 | 32.22 |
| 44453.96875 | 32.27 |
| 44453.979166666664 | 32.23 |
| 44453.989583333336 | 32.27 |
| 44454.0 | 32.22 |
| 44454.010416666664 | 32.21 |
| 44454.020833333336 | 32.13 |
| 44454.03125 | 32.04 |
| 44454.041666666664 | 31.97 |
| 44454.052083333336 | 31.87 |
| 44454.0625 | 31.79 |
| 44454.072916666664 | 31.74 |
| 44454.083333333336 | 31.71 |
| 44454.09375 | 31.71 |
| 44454.104166666664 | 31.76 |
| 44454.114583333336 | 31.79 |
| 44454.125 | 31.82 |
| 44454.135416666664 | 31.83 |
| 44454.145833333336 | 31.9 |
| 44454.15625 | 32 |
| 44454.166666666664 | 32.08 |
| 44454.177083333336 | 32.13 |
| 44454.1875 | 32.15 |
| 44454.197916666664 | 32.16 |
| 44454.208333333336 | 32.18 |
| 44454.21875 | 32.19 |
| 44454.229166666664 | 32.22 |
| 44454.239583333336 | 32.23 |
| 44454.25 | 32.24 |
| 44454.260416666664 | 29.76 |
| 44454.270833333336 | 32.26 |
| 44454.28125 | 32.27 |
| 44454.291666666664 | 32.28 |
| 44454.302083333336 | 32.29 |
| 44454.3125 | 32.29 |
| 44454.322916666664 | 32.31 |
| 44454.333333333336 | 32.31 |
| 44454.34375 | 32.32 |
| 44454.354166666664 | 32.25 |
| 44454.364583333336 | 32.28 |
| 44454.375 | 32.26 |
| 44454.385416666664 | 32.24 |
| 44454.395833333336 | 32.24 |
| 44454.40625 | 32.24 |
| 44454.416666666664 | 32.27 |
| 44454.427083333336 | 32.33 |
| 44454.4375 | 32.25 |
| 44454.447916666664 | 32.26 |
| 44454.458333333336 | 32.21 |
| 44454.46875 | 32.2 |
| 44454.479166666664 | 32.16 |
| 44454.489583333336 | 32.11 |
| 44454.5 | 32.04 |
| 44454.510416666664 | 31.95 |
| 44454.520833333336 | 31.86 |
| 44454.53125 | 31.79 |
| 44454.541666666664 | 31.76 |
| 44454.552083333336 | 31.72 |
| 44454.5625 | 31.68 |
| 44454.572916666664 | 31.67 |
| 44454.583333333336 | 31.65 |
| 44454.59375 | 31.66 |
| 44454.604166666664 | 31.66 |
| 44454.614583333336 | 31.69 |
| 44454.625 | 31.72 |
| 44454.635416666664 | 31.75 |
| 44454.645833333336 | 31.77 |
| 44454.65625 | 31.87 |
| 44454.666666666664 | 32.03 |
| 44454.677083333336 | 32.13 |
| 44454.6875 | 32.16 |
| 44454.697916666664 | 32.23 |
| 44454.708333333336 | 32.28 |
| 44454.71875 | 32.29 |
| 44454.729166666664 | 32.35 |
| 44454.739583333336 | 32.36 |
| 44454.75 | 32.37 |
| 44454.760416666664 | 32.39 |
| 44454.770833333336 | 32.4 |
| 44454.78125 | 32.41 |
| 44454.791666666664 | 32.41 |
| 44454.802083333336 | 32.4 |
| 44454.8125 | 32.4 |
| 44454.822916666664 | 32.4 |
| 44454.833333333336 | 32.39 |
| 44454.84375 | 32.41 |
| 44454.854166666664 | 32.41 |
| 44454.864583333336 | 32.42 |
| 44454.875 | 32.43 |
| 44454.885416666664 | 32.44 |
| 44454.895833333336 | 32.44 |
| 44454.90625 | 32.36 |
| 44454.916666666664 | 32.37 |
| 44454.927083333336 | 32.41 |
| 44454.9375 | 32.43 |
| 44454.947916666664 | 32.45 |
| 44454.958333333336 | 32.44 |
| 44454.96875 | 32.47 |
| 44454.979166666664 | 32.5 |
| 44454.989583333336 | 32.51 |
| 44455.0 | 32.51 |
| 44455.010416666664 | 32.52 |
| 44455.020833333336 | 32.53 |
| 44455.03125 | 32.49 |
| 44455.041666666664 | 32.44 |
| 44455.052083333336 | 32.38 |
| 44455.0625 | 32.35 |
| 44455.072916666664 | 32.27 |
| 44455.083333333336 | 32.21 |
| 44455.09375 | 32.14 |
| 44455.104166666664 | 32.1 |
| 44455.114583333336 | 32.05 |
| 44455.125 | 32.01 |
| 44455.135416666664 | 31.99 |
| 44455.145833333336 | 31.99 |
| 44455.15625 | 32.03 |
| 44455.166666666664 | 32.07 |
| 44455.177083333336 | 32.06 |
| 44455.1875 | 32.1 |
| 44455.197916666664 | 32.15 |
| 44455.208333333336 | 32.22 |
| 44455.21875 | 32.3 |
| 44455.229166666664 | 32.33 |
| 44455.239583333336 | 32.35 |
| 44455.25 | 32.37 |
| 44455.260416666664 | 32.4 |
| 44455.270833333336 | 32.43 |
| 44455.28125 | 32.46 |
| 44455.291666666664 | 32.5 |
| 44455.302083333336 | 32.51 |
| 44455.3125 | 32.54 |
| 44455.322916666664 | 32.55 |
| 44455.333333333336 | 32.56 |
| 44455.34375 | 32.56 |
| 44455.354166666664 | 32.56 |
| 44455.364583333336 | 32.56 |
| 44455.375 | 32.56 |
| 44455.385416666664 | 32.56 |
| 44455.395833333336 | 32.56 |
| 44455.40625 | 32.51 |
| 44455.416666666664 | 32.5 |
| 44455.427083333336 | 32.5 |
| 44455.4375 | 32.47 |
| 44455.447916666664 | 32.55 |
| 44455.458333333336 | 32.53 |
| 44455.46875 | 32.54 |
| 44455.479166666664 | 32.54 |
| 44455.489583333336 | 32.51 |
| 44455.5 | 32.53 |
| 44455.510416666664 | 32.49 |
| 44455.520833333336 | 32.43 |
| 44455.53125 | 32.39 |
| 44455.541666666664 | 32.33 |
| 44455.552083333336 | 32.23 |
| 44455.5625 | 32.13 |
| 44455.572916666664 | 32.09 |
| 44455.583333333336 | 32 |
| 44455.59375 | 31.97 |
| 44455.604166666664 | 31.93 |
| 44455.614583333336 | 31.89 |
| 44455.625 | 31.86 |
| 44455.635416666664 | 31.83 |
| 44455.645833333336 | 31.82 |
| 44455.65625 | 31.81 |
| 44455.666666666664 | 31.88 |
| 44455.677083333336 | 31.89 |
| 44455.6875 | 31.93 |
| 44455.697916666664 | 31.98 |
| 44455.708333333336 | 32.05 |
| 44455.71875 | 32.15 |
| 44455.729166666664 | 32.28 |
| 44455.739583333336 | 32.37 |
| 44455.75 | 32.43 |
| 44455.760416666664 | 32.44 |
| 44455.770833333336 | 32.46 |
| 44455.78125 | 32.5 |
| 44455.791666666664 | 32.52 |
| 44455.802083333336 | 32.55 |
| 44455.8125 | 32.56 |
| 44455.822916666664 | 32.6 |
| 44455.833333333336 | 32.58 |
| 44455.84375 | 32.57 |
| 44455.854166666664 | 32.55 |
| 44455.864583333336 | 32.55 |
| 44455.875 | 32.55 |
| 44455.885416666664 | 32.55 |
| 44455.895833333336 | 32.55 |
| 44455.90625 | 32.54 |
| 44455.916666666664 | 32.53 |
| 44455.927083333336 | 32.52 |
| 44455.9375 | 32.46 |
| 44455.947916666664 | 32.51 |
| 44455.958333333336 | 32.52 |
| 44455.96875 | 32.54 |
| 44455.979166666664 | 32.57 |
| 44455.989583333336 | 32.59 |
| 44456.0 | 32.59 |
| 44456.010416666664 | 32.62 |
| 44456.020833333336 | 32.62 |
| 44456.03125 | 32.63 |
| 44456.041666666664 | 32.65 |
| 44456.052083333336 | 32.64 |
| 44456.0625 | 32.62 |
| 44456.072916666664 | 32.64 |
| 44456.083333333336 | 32.62 |
| 44456.09375 | 32.6 |
| 44456.104166666664 | 32.57 |
| 44456.114583333336 | 32.53 |
| 44456.125 | 32.4 |
| 44456.135416666664 | 32.33 |
| 44456.145833333336 | 32.24 |
| 44456.15625 | 32.22 |
| 44456.166666666664 | 32.1 |
| 44456.177083333336 | 32.06 |
| 44456.1875 | 32.07 |
| 44456.197916666664 | 32.13 |
| 44456.208333333336 | 32.16 |
| 44456.21875 | 32.13 |
| 44456.229166666664 | 32.15 |
| 44456.239583333336 | 32.19 |
| 44456.25 | 32.23 |
| 44456.260416666664 | 32.28 |
| 44456.270833333336 | 32.35 |
| 44456.28125 | 32.4 |
| 44456.291666666664 | 32.44 |
| 44456.302083333336 | 32.46 |
| 44456.3125 | 32.49 |
| 44456.322916666664 | 32.52 |
| 44456.333333333336 | 32.54 |
| 44456.34375 | 32.56 |
| 44456.354166666664 | 32.58 |
| 44456.364583333336 | 32.58 |
| 44456.375 | 32.58 |
| 44456.385416666664 | 32.58 |
| 44456.395833333336 | 32.58 |
| 44456.40625 | 32.59 |
| 44456.416666666664 | 32.58 |
| 44456.427083333336 | 32.54 |
| 44456.4375 | 32.51 |
| 44456.447916666664 | 32.56 |
| 44456.458333333336 | 32.55 |
| 44456.46875 | 32.56 |
| 44456.479166666664 | 32.56 |
| 44456.489583333336 | 32.57 |
| 44456.5 | 32.57 |
| 44456.510416666664 | 32.58 |
| 44456.520833333336 | 32.58 |
| 44456.53125 | 32.55 |
| 44456.541666666664 | 32.54 |
| 44456.552083333336 | 32.54 |
| 44456.5625 | 32.54 |
| 44456.572916666664 | 32.52 |
| 44456.583333333336 | 32.49 |
| 44456.59375 | 32.52 |
| 44456.604166666664 | 32.48 |
| 44456.614583333336 | 32.43 |
| 44456.625 | 32.39 |
| 44456.635416666664 | 32.37 |
| 44456.645833333336 | 32.34 |
| 44456.65625 | 32.38 |
| 44456.666666666664 | 32.26 |
| 44456.677083333336 | 32.23 |
| 44456.6875 | 32.19 |
| 44456.697916666664 | 32.17 |
| 44456.708333333336 | 32.2 |
| 44456.71875 | 32.18 |
| 44456.729166666664 | 32.14 |
| 44456.739583333336 | 32.14 |
| 44456.75 | 32.16 |
| 44456.760416666664 | 32.2 |
| 44456.770833333336 | 32.25 |
| 44456.78125 | 32.31 |
| 44456.791666666664 | 32.33 |
| 44456.802083333336 | 32.4 |
| 44456.8125 | 32.44 |
| 44456.822916666664 | 32.45 |
| 44456.833333333336 | 32.47 |
| 44456.84375 | 32.49 |
| 44456.854166666664 | 32.51 |
| 44456.864583333336 | 32.52 |
| 44456.875 | 32.53 |
| 44456.885416666664 | 32.54 |
| 44456.895833333336 | 32.54 |
| 44456.90625 | 32.53 |
| 44456.916666666664 | 32.53 |
| 44456.927083333336 | 32.53 |
| 44456.9375 | 32.52 |
| 44456.947916666664 | 32.51 |
| 44456.958333333336 | 32.5 |
| 44456.96875 | 32.51 |
| 44456.979166666664 | 32.5 |
| 44456.989583333336 | 32.47 |
| 44457.0 | 32.48 |
| 44457.010416666664 | 32.5 |
| 44457.020833333336 | 32.52 |
| 44457.03125 | 32.54 |
| 44457.041666666664 | 32.55 |
| 44457.052083333336 | 32.55 |
| 44457.0625 | 32.55 |
| 44457.072916666664 | 32.55 |
| 44457.083333333336 | 32.58 |
| 44457.09375 | 32.58 |
| 44457.104166666664 | 32.59 |
| 44457.114583333336 | 32.58 |
| 44457.125 | 32.59 |
| 44457.135416666664 | 32.59 |
| 44457.145833333336 | 32.58 |
| 44457.15625 | 32.57 |
| 44457.166666666664 | 32.56 |
| 44457.177083333336 | 32.53 |
| 44457.1875 | 32.48 |
| 44457.197916666664 | 32.45 |
| 44457.208333333336 | 32.42 |
| 44457.21875 | 32.37 |
| 44457.229166666664 | 32.35 |
| 44457.239583333336 | 32.35 |
| 44457.25 | 32.39 |
| 44457.260416666664 | 32.41 |
| 44457.270833333336 | 32.34 |
| 44457.28125 | 32.4 |
| 44457.291666666664 | 32.44 |
| 44457.302083333336 | 32.42 |
| 44457.3125 | 32.5 |
| 44457.322916666664 | 32.51 |
| 44457.333333333336 | 32.51 |
| 44457.34375 | 32.52 |
| 44457.354166666664 | 32.53 |
| 44457.364583333336 | 32.54 |
| 44457.375 | 32.54 |
| 44457.385416666664 | 32.55 |
| 44457.395833333336 | 32.55 |
| 44457.40625 | 32.56 |
| 44457.416666666664 | 32.56 |
| 44457.427083333336 | 32.56 |
| 44457.4375 | 32.56 |
| 44457.447916666664 | 32.56 |
| 44457.458333333336 | 32.56 |
| 44457.46875 | 32.55 |
| 44457.479166666664 | 32.54 |
| 44457.489583333336 | 32.53 |
| 44457.5 | 32.53 |
| 44457.510416666664 | 32.53 |
| 44457.520833333336 | 32.54 |
| 44457.53125 | 32.54 |
| 44457.541666666664 | 32.54 |
| 44457.552083333336 | 32.55 |
| 44457.5625 | 32.55 |
| 44457.572916666664 | 32.54 |
| 44457.583333333336 | 32.55 |
| 44457.59375 | 32.54 |
| 44457.604166666664 | 32.53 |
| 44457.614583333336 | 32.54 |
| 44457.625 | 32.56 |
| 44457.635416666664 | 32.56 |
| 44457.645833333336 | 32.56 |
| 44457.65625 | 32.53 |
| 44457.666666666664 | 32.54 |
| 44457.677083333336 | 32.4 |
| 44457.6875 | 32.47 |
| 44457.697916666664 | 32.45 |
| 44457.708333333336 | 32.41 |
| 44457.71875 | 32.35 |
| 44457.729166666664 | 32.35 |
| 44457.739583333336 | 32.3 |
| 44457.75 | 32.38 |
| 44457.760416666664 | 32.34 |
| 44457.770833333336 | 32.33 |
| 44457.78125 | 32.36 |
| 44457.791666666664 | 32.37 |
| 44457.802083333336 | 32.43 |
| 44457.8125 | 32.49 |
| 44457.822916666664 | 32.51 |
| 44457.833333333336 | 32.52 |
| 44457.84375 | 32.53 |
| 44457.854166666664 | 32.53 |
| 44457.864583333336 | 32.54 |
| 44457.875 | 32.56 |
| 44457.885416666664 | 32.57 |
| 44457.895833333336 | 32.58 |
| 44457.90625 | 32.58 |
| 44457.916666666664 | 32.57 |
| 44457.927083333336 | 32.57 |
| 44457.9375 | 32.56 |
| 44457.947916666664 | 32.56 |
| 44457.958333333336 | 32.56 |
| 44457.96875 | 32.55 |
| 44457.979166666664 | 32.56 |
| 44457.989583333336 | 32.56 |
| 44458.0 | 32.56 |
| 44458.010416666664 | 32.56 |
| 44458.020833333336 | 32.54 |
| 44458.03125 | 32.56 |
| 44458.041666666664 | 32.56 |
| 44458.052083333336 | 32.56 |
| 44458.0625 | 32.58 |
| 44458.072916666664 | 32.6 |
| 44458.083333333336 | 32.61 |
| 44458.09375 | 32.6 |
| 44458.104166666664 | 32.63 |
| 44458.114583333336 | 32.64 |
| 44458.125 | 32.61 |
| 44458.135416666664 | 32.64 |
| 44458.145833333336 | 32.63 |
| 44458.15625 | 32.68 |
| 44458.166666666664 | 32.64 |
| 44458.177083333336 | 32.68 |
| 44458.1875 | 32.67 |
| 44458.197916666664 | 32.62 |
| 44458.208333333336 | 32.58 |
| 44458.21875 | 32.52 |
| 44458.229166666664 | 32.44 |
| 44458.239583333336 | 32.41 |
| 44458.25 | 32.4 |
| 44458.260416666664 | 32.33 |
| 44458.270833333336 | 32.32 |
| 44458.28125 | 32.35 |
| 44458.291666666664 | 32.41 |
| 44458.302083333336 | 32.37 |
| 44458.3125 | 32.39 |
| 44458.322916666664 | 32.44 |
| 44458.333333333336 | 32.48 |
| 44458.34375 | 32.52 |
| 44458.354166666664 | 32.55 |
| 44458.364583333336 | 32.56 |
| 44458.375 | 32.58 |
| 44458.385416666664 | 32.58 |
| 44458.395833333336 | 22.38 |
| 44458.40625 | 32.5 |
| 44458.416666666664 | 32.6 |
| 44458.427083333336 | 32.6 |
| 44458.4375 | 32.61 |
| 44458.447916666664 | 32.61 |
| 44458.458333333336 | 32.61 |
| 44458.46875 | 32.6 |
| 44458.479166666664 | 32.6 |
| 44458.489583333336 | 32.6 |
| 44458.5 | 32.6 |
| 44458.510416666664 | 32.58 |
| 44458.520833333336 | 32.59 |
| 44458.53125 | 32.56 |
| 44458.541666666664 | 32.59 |
| 44458.552083333336 | 32.58 |
| 44458.5625 | 32.59 |
| 44458.572916666664 | 32.59 |
| 44458.583333333336 | 32.6 |
| 44458.59375 | 32.59 |
| 44458.604166666664 | 32.62 |
| 44458.614583333336 | 32.62 |
| 44458.625 | 32.6 |
| 44458.635416666664 | 32.6 |
| 44458.645833333336 | 32.62 |
| 44458.65625 | 32.57 |
| 44458.666666666664 | 32.63 |
| 44458.677083333336 | 32.62 |
| 44458.6875 | 32.59 |
| 44458.697916666664 | 32.56 |
| 44458.708333333336 | 32.55 |
| 44458.71875 | 32.52 |
| 44458.729166666664 | 32.51 |
| 44458.739583333336 | 32.53 |
| 44458.75 | 32.49 |
| 44458.760416666664 | 32.47 |
| 44458.770833333336 | 32.41 |
| 44458.78125 | 32.41 |
| 44458.791666666664 | 32.43 |
| 44458.802083333336 | 32.4 |
| 44458.8125 | 32.38 |
| 44458.822916666664 | 32.42 |
| 44458.833333333336 | 32.48 |
| 44458.84375 | 32.52 |
| 44458.854166666664 | 32.55 |
| 44458.864583333336 | 32.59 |
| 44458.875 | 32.59 |
| 44458.885416666664 | 32.61 |
| 44458.895833333336 | 32.62 |
| 44458.90625 | 32.64 |
| 44458.916666666664 | 32.65 |
| 44458.927083333336 | 32.66 |
| 44458.9375 | 32.67 |
| 44458.947916666664 | 32.68 |
| 44458.958333333336 | 32.67 |
| 44458.96875 | 32.66 |
| 44458.979166666664 | 32.62 |
| 44458.989583333336 | 32.64 |
| 44459.0 | 32.63 |
| 44459.010416666664 | 32.63 |
| 44459.020833333336 | 32.63 |
| 44459.03125 | 32.62 |
| 44459.041666666664 | 32.61 |
| 44459.052083333336 | 32.63 |
| 44459.0625 | 32.64 |
| 44459.072916666664 | 32.65 |
| 44459.083333333336 | 32.66 |
| 44459.09375 | 32.65 |
| 44459.104166666664 | 32.66 |
| 44459.114583333336 | 32.69 |
| 44459.125 | 32.7 |
| 44459.135416666664 | 32.72 |
| 44459.145833333336 | 32.76 |
| 44459.15625 | 32.75 |
| 44459.166666666664 | 32.74 |
| 44459.177083333336 | 32.75 |
| 44459.1875 | 32.75 |
| 44459.197916666664 | 32.68 |
| 44459.208333333336 | 32.7 |
| 44459.21875 | 32.74 |
| 44459.229166666664 | 32.71 |
| 44459.239583333336 | 32.68 |
| 44459.25 | 32.62 |
| 44459.260416666664 | 32.59 |
| 44459.270833333336 | 32.56 |
| 44459.28125 | 32.52 |
| 44459.291666666664 | 32.5 |
| 44459.302083333336 | 32.47 |
| 44459.3125 | 32.52 |
| 44459.322916666664 | 32.54 |
| 44459.333333333336 | 32.51 |
| 44459.34375 | 32.53 |
| 44459.354166666664 | 32.58 |
| 44459.364583333336 | 32.61 |
| 44459.375 | 32.37 |
| 44459.385416666664 | 32.68 |
| 44459.395833333336 | 32.69 |
| 44459.40625 | 32.68 |
| 44459.416666666664 | 32.7 |
| 44459.427083333336 | 32.71 |
| 44459.4375 | 32.72 |
| 44459.447916666664 | 32.72 |
| 44459.458333333336 | 32.73 |
| 44459.46875 | 32.72 |
| 44459.479166666664 | 32.72 |
| 44459.489583333336 | 32.72 |
| 44459.5 | 32.72 |
| 44459.510416666664 | 32.71 |
| 44459.520833333336 | 32.7 |
| 44459.53125 | 32.68 |
| 44459.541666666664 | 32.68 |
| 44459.552083333336 | 32.66 |
| 44459.5625 | 32.67 |
| 44459.572916666664 | 32.66 |
| 44459.583333333336 | 32.65 |
| 44459.59375 | 32.7 |
| 44459.604166666664 | 32.72 |
| 44459.614583333336 | 32.73 |
| 44459.625 | 32.75 |
| 44459.635416666664 | 32.75 |
| 44459.645833333336 | 32.77 |
| 44459.65625 | 32.74 |
| 44459.666666666664 | 32.73 |
| 44459.677083333336 | 32.76 |
| 44459.6875 | 32.79 |
| 44459.697916666664 | 32.74 |
| 44459.708333333336 | 32.79 |
| 44459.71875 | 32.76 |
| 44459.729166666664 | 32.77 |
| 44459.739583333336 | 32.71 |
| 44459.75 | 32.72 |
| 44459.760416666664 | 32.71 |
| 44459.770833333336 | 32.67 |
| 44459.78125 | 32.65 |
| 44459.791666666664 | 32.64 |
| 44459.802083333336 | 32.62 |
| 44459.8125 | 32.64 |
| 44459.822916666664 | 32.64 |
| 44459.833333333336 | 32.6 |
| 44459.84375 | 32.56 |
| 44459.854166666664 | 32.58 |
| 44459.864583333336 | 32.62 |
| 44459.875 | 32.64 |
| 44459.885416666664 | 32.67 |
| 44459.895833333336 | 32.71 |
| 44459.90625 | 32.72 |
| 44459.916666666664 | 32.75 |
| 44459.927083333336 | 32.76 |
| 44459.9375 | 32.78 |
| 44459.947916666664 | 32.78 |
| 44459.958333333336 | 32.79 |
| 44459.96875 | 32.79 |
| 44459.979166666664 | 32.79 |
| 44459.989583333336 | 32.79 |
| 44460.0 | 32.78 |
| 44460.010416666664 | 32.76 |
| 44460.020833333336 | 32.67 |
| 44460.03125 | 32.72 |
| 44460.041666666664 | 32.69 |
| 44460.052083333336 | 32.68 |
| 44460.0625 | 32.66 |
| 44460.072916666664 | 32.72 |
| 44460.083333333336 | 32.67 |
| 44460.09375 | 32.66 |
| 44460.104166666664 | 32.7 |
| 44460.114583333336 | 32.72 |
| 44460.125 | 32.74 |
| 44460.135416666664 | 32.78 |
| 44460.145833333336 | 32.79 |
| 44460.15625 | 32.83 |
| 44460.166666666664 | 32.85 |
| 44460.177083333336 | 32.86 |
| 44460.1875 | 32.86 |
| 44460.197916666664 | 32.82 |
| 44460.208333333336 | 32.84 |
| 44460.21875 | 32.82 |
| 44460.229166666664 | 32.81 |
| 44460.239583333336 | 32.84 |
| 44460.25 | 32.84 |
| 44460.260416666664 | 32.81 |
| 44460.270833333336 | 32.78 |
| 44460.28125 | 32.74 |
| 44460.291666666664 | 32.72 |
| 44460.302083333336 | 32.71 |
| 44460.3125 | 32.69 |
| 44460.322916666664 | 32.66 |
| 44460.333333333336 | 32.66 |
| 44460.34375 | 31.74 |
| 44460.354166666664 | 32.66 |
| 44460.364583333336 | 32.68 |
| 44460.375 | 32.7 |
| 44460.385416666664 | 32.73 |
| 44460.395833333336 | 32.74 |
| 44460.40625 | 32.74 |
| 44460.416666666664 | 32.75 |
| 44460.427083333336 | 32.77 |
| 44460.4375 | 32.79 |
| 44460.447916666664 | 32.78 |
| 44460.458333333336 | 32.78 |
| 44460.46875 | 32.78 |
| 44460.479166666664 | 32.79 |
| 44460.489583333336 | 32.8 |
| 44460.5 | 32.8 |
| 44460.510416666664 | 32.8 |
| 44460.520833333336 | 32.78 |
| 44460.53125 | 32.76 |
| 44460.541666666664 | 32.73 |
| 44460.552083333336 | 32.71 |
| 44460.5625 | 32.7 |
| 44460.572916666664 | 32.69 |
| 44460.583333333336 | 32.67 |
| 44460.59375 | 32.69 |
| 44460.604166666664 | 32.68 |
| 44460.614583333336 | 32.7 |
| 44460.625 | 32.76 |
| 44460.635416666664 | 32.81 |
| 44460.645833333336 | 32.83 |
| 44460.65625 | 32.82 |
| 44460.666666666664 | 32.84 |
| 44460.677083333336 | 32.8 |
| 44460.6875 | 32.84 |
| 44460.697916666664 | 32.8 |
| 44460.708333333336 | 32.86 |
| 44460.71875 | 32.79 |
| 44460.729166666664 | 32.83 |
| 44460.739583333336 | 32.86 |
| 44460.75 | 32.81 |
| 44460.760416666664 | 32.83 |
| 44460.770833333336 | 32.82 |
| 44460.78125 | 32.8 |
| 44460.791666666664 | 32.78 |
| 44460.802083333336 | 32.76 |
| 44460.8125 | 32.74 |
| 44460.822916666664 | 32.73 |
| 44460.833333333336 | 32.72 |
| 44460.84375 | 32.69 |
| 44460.854166666664 | 32.71 |
| 44460.864583333336 | 32.67 |
| 44460.875 | 32.65 |
| 44460.885416666664 | 32.68 |
| 44460.895833333336 | 32.7 |
| 44460.90625 | 32.74 |
| 44460.916666666664 | 32.76 |
| 44460.927083333336 | 32.76 |
| 44460.9375 | 32.78 |
| 44460.947916666664 | 32.79 |
| 44460.958333333336 | 27.47 |
| 44460.96875 | 32.81 |
| 44460.979166666664 | 32.8 |
| 44460.989583333336 | 32.81 |
| 44461.0 | 32.81 |
| 44461.010416666664 | 32.81 |
| 44461.020833333336 | 32.81 |
| 44461.03125 | 32.81 |
| 44461.041666666664 | 32.8 |
| 44461.052083333336 | 32.79 |
| 44461.0625 | 32.79 |
| 44461.072916666664 | 32.78 |
| 44461.083333333336 | 32.76 |
| 44461.09375 | 32.75 |
| 44461.104166666664 | 32.73 |
| 44461.114583333336 | 32.77 |
| 44461.125 | 32.76 |
| 44461.135416666664 | 32.8 |
| 44461.145833333336 | 32.77 |
| 44461.15625 | 32.81 |
| 44461.166666666664 | 32.83 |
| 44461.177083333336 | 32.83 |
| 44461.1875 | 32.85 |
| 44461.197916666664 | 32.85 |
| 44461.208333333336 | 32.85 |
| 44461.21875 | 32.88 |
| 44461.229166666664 | 32.85 |
| 44461.239583333336 | 32.86 |
| 44461.25 | 32.87 |
| 44461.260416666664 | 32.85 |
| 44461.270833333336 | 32.84 |
| 44461.28125 | 32.83 |
| 44461.291666666664 | 32.8 |
| 44461.302083333336 | 32.77 |
| 44461.3125 | 32.74 |
| 44461.322916666664 | 32.72 |
| 44461.333333333336 | 32.71 |
| 44461.34375 | 32.7 |
| 44461.354166666664 | 32.69 |
| 44461.364583333336 | 32.72 |
| 44461.375 | 32.71 |
| 44461.385416666664 | 32.72 |
| 44461.395833333336 | 32.74 |
| 44461.40625 | 32.78 |
| 44461.416666666664 | 32.79 |
| 44461.427083333336 | 32.81 |
| 44461.4375 | 32.82 |
| 44461.447916666664 | 32.82 |
| 44461.458333333336 | 32.82 |
| 44461.46875 | 32.83 |
| 44461.479166666664 | 32.84 |
| 44461.489583333336 | 32.84 |
| 44461.5 | 32.84 |
| 44461.510416666664 | 32.84 |
| 44461.520833333336 | 32.84 |
| 44461.53125 | 32.84 |
| 44461.541666666664 | 32.84 |
| 44461.552083333336 | 32.82 |
| 44461.5625 | 32.81 |
| 44461.572916666664 | 32.79 |
| 44461.583333333336 | 32.78 |
| 44461.59375 | 32.87 |
| 44461.604166666664 | 32.88 |
| 44461.614583333336 | 32.88 |
| 44461.625 | 32.88 |
| 44461.635416666664 | 32.89 |
| 44461.645833333336 | 32.93 |
| 44461.65625 | 32.95 |
| 44461.666666666664 | 32.96 |
| 44461.677083333336 | 32.97 |
| 44461.6875 | 32.97 |
| 44461.697916666664 | 32.98 |
| 44461.708333333336 | 32.99 |
| 44461.71875 | 32.98 |
| 44461.729166666664 | 32.99 |
| 44461.739583333336 | 32.99 |
| 44461.75 | 32.99 |
| 44461.760416666664 | 32.99 |
| 44461.770833333336 | 33 |
| 44461.78125 | 33.01 |
| 44461.791666666664 | 33.01 |
| 44461.802083333336 | 32.99 |
| 44461.8125 | 32.94 |
| 44461.822916666664 | 32.93 |
| 44461.833333333336 | 32.9 |
| 44461.84375 | 32.9 |
| 44461.854166666664 | 32.88 |
| 44461.864583333336 | 32.88 |
| 44461.875 | 32.89 |
| 44461.885416666664 | 32.87 |
| 44461.895833333336 | 32.89 |
| 44461.90625 | 32.9 |
| 44461.916666666664 | 32.95 |
| 44461.927083333336 | 32.98 |
| 44461.9375 | 32.99 |
| 44461.947916666664 | 33 |
| 44461.958333333336 | 33.01 |
| 44461.96875 | 33.03 |
| 44461.979166666664 | 33.06 |
| 44461.989583333336 | 33.07 |
| 44462.0 | 33.09 |
| 44462.010416666664 | 33.08 |
| 44462.020833333336 | 33.08 |
| 44462.03125 | 33.1 |
| 44462.041666666664 | 33.11 |
| 44462.052083333336 | 33.14 |
| 44462.0625 | 33.14 |
| 44462.072916666664 | 33.14 |
| 44462.083333333336 | 33.14 |
| 44462.09375 | 33.14 |
| 44462.104166666664 | 33.13 |
| 44462.114583333336 | 33.14 |
| 44462.125 | 33.14 |
| 44462.135416666664 | 33.14 |
| 44462.145833333336 | 33.1 |
| 44462.15625 | 33.08 |
| 44462.166666666664 | 33.15 |
| 44462.177083333336 | 33.15 |
| 44462.1875 | 33.16 |
| 44462.197916666664 | 33.16 |
| 44462.208333333336 | 33.17 |
| 44462.21875 | 33.16 |
| 44462.229166666664 | 33.17 |
| 44462.239583333336 | 33.15 |
| 44462.25 | 33.14 |
| 44462.260416666664 | 33.1 |
| 44462.270833333336 | 33.08 |
| 44462.28125 | 33.09 |
| 44462.291666666664 | 33.06 |
| 44462.302083333336 | 33.05 |
| 44462.3125 | 33.02 |
| 44462.322916666664 | 32.98 |
| 44462.333333333336 | 32.95 |
| 44462.34375 | 32.95 |
| 44462.354166666664 | 32.94 |
| 44462.364583333336 | 32.94 |
| 44462.375 | 32.97 |
| 44462.385416666664 | 32.96 |
| 44462.395833333336 | 32.98 |
| 44462.40625 | 33.01 |
| 44462.416666666664 | 33.09 |
| 44462.427083333336 | 33.2 |
| 44462.4375 | 33.17 |
| 44462.447916666664 | 33.21 |
| 44462.458333333336 | 33.32 |
| 44462.46875 | 33.41 |
| 44462.479166666664 | 33.46 |
| 44462.489583333336 | 33.49 |
| 44462.5 | 33.51 |
| 44462.510416666664 | 33.5 |
| 44462.520833333336 | 33.5 |
| 44462.53125 | 33.5 |
| 44462.541666666664 | 33.52 |
| 44462.552083333336 | 33.51 |
| 44462.5625 | 33.5 |
| 44462.572916666664 | 33.46 |
| 44462.583333333336 | 33.43 |
| 44462.59375 | 33.4 |
| 44462.604166666664 | 33.39 |
| 44462.614583333336 | 33.39 |
| 44462.625 | 33.39 |
| 44462.635416666664 | 33.38 |
| 44462.645833333336 | 33.39 |
| 44462.65625 | 33.34 |
| 44462.666666666664 | 33.32 |
| 44462.677083333336 | 33.41 |
| 44462.6875 | 33.43 |
| 44462.697916666664 | 33.38 |
| 44462.708333333336 | 33.35 |
| 44462.71875 | 33.3 |
| 44462.729166666664 | 33.23 |
| 44462.739583333336 | 33.18 |
| 44462.75 | 33.12 |
| 44462.760416666664 | 33.07 |
| 44462.770833333336 | 33 |
| 44462.78125 | 32.95 |
| 44462.791666666664 | 32.91 |
| 44462.802083333336 | 32.89 |
| 44462.8125 | 32.85 |
| 44462.822916666664 | 32.81 |
| 44462.833333333336 | 32.71 |
| 44462.84375 | 32.63 |
| 44462.854166666664 | 32.57 |
| 44462.864583333336 | 32.58 |
| 44462.875 | 32.51 |
| 44462.885416666664 | 31.94 |
| 44462.895833333336 | 32.47 |
| 44462.90625 | 32.56 |
| 44462.916666666664 | 32.47 |
| 44462.927083333336 | 32.52 |
| 44462.9375 | 32.58 |
| 44462.947916666664 | 32.63 |
| 44462.958333333336 | 32.74 |
| 44462.96875 | 32.79 |
| 44462.979166666664 | 32.83 |
| 44462.989583333336 | 32.84 |
| 44463.0 | 32.86 |
| 44463.010416666664 | 32.87 |
| 44463.020833333336 | 32.89 |
| 44463.03125 | 32.92 |
| 44463.041666666664 | 32.94 |
| 44463.052083333336 | 32.97 |
| 44463.0625 | 33 |
| 44463.072916666664 | 33.03 |
| 44463.083333333336 | 33.07 |
| 44463.09375 | 33.08 |
| 44463.104166666664 | 33.07 |
| 44463.114583333336 | 33.06 |
| 44463.125 | 33.05 |
| 44463.135416666664 | 33.04 |
| 44463.145833333336 | 33.03 |
| 44463.15625 | 33.01 |
| 44463.166666666664 | 33 |
| 44463.177083333336 | 32.99 |
| 44463.1875 | 32.99 |
| 44463.197916666664 | 33.01 |
| 44463.208333333336 | 32.95 |
| 44463.21875 | 32.96 |
| 44463.229166666664 | 32.94 |
| 44463.239583333336 | 32.85 |
| 44463.25 | 32.8 |
| 44463.260416666664 | 32.75 |
| 44463.270833333336 | 32.8 |
| 44463.28125 | 32.72 |
| 44463.291666666664 | 32.66 |
| 44463.302083333336 | 32.62 |
| 44463.3125 | 32.61 |
| 44463.322916666664 | 32.58 |
| 44463.333333333336 | 32.6 |
| 44463.34375 | 32.5 |
| 44463.354166666664 | 32.47 |
| 44463.364583333336 | 32.43 |
| 44463.375 | 32.42 |
| 44463.385416666664 | 32.41 |
| 44463.395833333336 | 32.4 |
| 44463.40625 | 32.46 |
| 44463.416666666664 | 32.52 |
| 44463.427083333336 | 32.47 |
| 44463.4375 | 32.47 |
| 44463.447916666664 | 32.53 |
| 44463.458333333336 | 32.58 |
| 44463.46875 | 32.65 |
| 44463.479166666664 | 32.73 |
| 44463.489583333336 | 32.79 |
| 44463.5 | 32.81 |
| 44463.510416666664 | 32.81 |
| 44463.520833333336 | 32.82 |
| 44463.53125 | 32.87 |
| 44463.541666666664 | 32.92 |
| 44463.552083333336 | 32.94 |
| 44463.5625 | 32.96 |
| 44463.572916666664 | 32.95 |
| 44463.583333333336 | 32.93 |
| 44463.59375 | 32.9 |
| 44463.604166666664 | 32.88 |
| 44463.614583333336 | 32.85 |
| 44463.625 | 32.82 |
| 44463.635416666664 | 32.79 |
| 44463.645833333336 | 32.78 |
| 44463.65625 | 32.79 |
| 44463.666666666664 | 32.76 |
| 44463.677083333336 | 32.79 |
| 44463.6875 | 32.79 |
| 44463.697916666664 | 32.85 |
| 44463.708333333336 | 32.88 |
| 44463.71875 | 32.91 |
| 44463.729166666664 | 32.93 |
| 44463.739583333336 | 32.91 |
| 44463.75 | 32.91 |
| 44463.760416666664 | 32.91 |
| 44463.770833333336 | 32.9 |
| 44463.78125 | 32.91 |
| 44463.791666666664 | 32.88 |
| 44463.802083333336 | 32.85 |
| 44463.8125 | 32.86 |
| 44463.822916666664 | 32.83 |
| 44463.833333333336 | 32.82 |
| 44463.84375 | 32.81 |
| 44463.854166666664 | 32.79 |
| 44463.864583333336 | 32.76 |
| 44463.875 | 32.74 |
| 44463.885416666664 | 32.71 |
| 44463.895833333336 | 32.7 |
| 44463.90625 | 32.65 |
| 44463.916666666664 | 32.6 |
| 44463.927083333336 | 32.59 |
| 44463.9375 | 32.66 |
| 44463.947916666664 | 32.66 |
| 44463.958333333336 | 32.64 |
| 44463.96875 | 32.61 |
| 44463.979166666664 | 32.63 |
| 44463.989583333336 | 32.69 |
| 44464.0 | 32.73 |
| 44464.010416666664 | 32.79 |
| 44464.020833333336 | 32.79 |
| 44464.03125 | 32.8 |
| 44464.041666666664 | 32.83 |
| 44464.052083333336 | 32.83 |
| 44464.0625 | 32.84 |
| 44464.072916666664 | 32.85 |
| 44464.083333333336 | 32.86 |
| 44464.09375 | 32.87 |
| 44464.104166666664 | 32.88 |
| 44464.114583333336 | 32.88 |
| 44464.125 | 32.9 |
| 44464.135416666664 | 32.9 |
| 44464.145833333336 | 32.9 |
| 44464.15625 | 32.9 |
| 44464.166666666664 | 32.9 |
| 44464.177083333336 | 32.86 |
| 44464.1875 | 32.87 |
| 44464.197916666664 | 32.87 |
| 44464.208333333336 | 32.87 |
| 44464.21875 | 32.87 |
| 44464.229166666664 | 32.89 |
| 44464.239583333336 | 32.89 |
| 44464.25 | 32.91 |
| 44464.260416666664 | 32.88 |
| 44464.270833333336 | 32.88 |
| 44464.28125 | 32.87 |
| 44464.291666666664 | 32.88 |
| 44464.302083333336 | 32.86 |
| 44464.3125 | 32.82 |
| 44464.322916666664 | 32.8 |
| 44464.333333333336 | 32.73 |
| 44464.34375 | 32.72 |
| 44464.354166666664 | 32.67 |
| 44464.364583333336 | 32.62 |
| 44464.375 | 32.61 |
| 44464.385416666664 | 32.59 |
| 44464.395833333336 | 32.55 |
| 44464.40625 | 32.55 |
| 44464.416666666664 | 32.56 |
| 44464.427083333336 | 32.61 |
| 44464.4375 | 32.63 |
| 44464.447916666664 | 32.6 |
| 44464.458333333336 | 32.6 |
| 44464.46875 | 32.64 |
| 44464.479166666664 | 32.69 |
| 44464.489583333336 | 32.71 |
| 44464.5 | 32.77 |
| 44464.510416666664 | 32.81 |
| 44464.520833333336 | 32.83 |
| 44464.53125 | 32.84 |
| 44464.541666666664 | 32.84 |
| 44464.552083333336 | 32.86 |
| 44464.5625 | 32.88 |
| 44464.572916666664 | 32.89 |
| 44464.583333333336 | 32.9 |
| 44464.59375 | 32.91 |
| 44464.604166666664 | 32.91 |
| 44464.614583333336 | 32.91 |
| 44464.625 | 32.91 |
| 44464.635416666664 | 32.88 |
| 44464.645833333336 | 32.87 |
| 44464.65625 | 32.83 |
| 44464.666666666664 | 32.83 |
| 44464.677083333336 | 32.81 |
| 44464.6875 | 32.8 |
| 44464.697916666664 | 32.8 |
| 44464.708333333336 | 32.81 |
| 44464.71875 | 32.81 |
| 44464.729166666664 | 32.87 |
| 44464.739583333336 | 32.91 |
| 44464.75 | 32.9 |
| 44464.760416666664 | 32.89 |
| 44464.770833333336 | 32.9 |
| 44464.78125 | 32.9 |
| 44464.791666666664 | 32.88 |
| 44464.802083333336 | 32.91 |
| 44464.8125 | 32.91 |
| 44464.822916666664 | 32.89 |
| 44464.833333333336 | 32.88 |
| 44464.84375 | 32.87 |
| 44464.854166666664 | 32.86 |
| 44464.864583333336 | 32.85 |
| 44464.875 | 32.84 |
| 44464.885416666664 | 32.82 |
| 44464.895833333336 | 32.78 |
| 44464.90625 | 32.76 |
| 44464.916666666664 | 32.73 |
| 44464.927083333336 | 32.7 |
| 44464.9375 | 32.68 |
| 44464.947916666664 | 32.68 |
| 44464.958333333336 | 32.72 |
| 44464.96875 | 32.71 |
| 44464.979166666664 | 32.68 |
| 44464.989583333336 | 32.67 |
| 44465.0 | 32.7 |
| 44465.010416666664 | 32.74 |
| 44465.020833333336 | 32.76 |
| 44465.03125 | 32.8 |
| 44465.041666666664 | 32.81 |
| 44465.052083333336 | 32.81 |
| 44465.0625 | 32.82 |
| 44465.072916666664 | 32.83 |
| 44465.083333333336 | 32.85 |
| 44465.09375 | 32.86 |
| 44465.104166666664 | 32.87 |
| 44465.114583333336 | 32.87 |
| 44465.125 | 32.88 |
| 44465.135416666664 | 32.88 |
| 44465.145833333336 | 32.89 |
| 44465.15625 | 32.88 |
| 44465.166666666664 | 32.89 |
| 44465.177083333336 | 32.9 |
| 44465.1875 | 32.9 |
| 44465.197916666664 | 32.9 |
| 44465.208333333336 | 32.84 |
| 44465.21875 | 32.87 |
| 44465.229166666664 | 32.87 |
| 44465.239583333336 | 32.87 |
| 44465.25 | 32.91 |
| 44465.260416666664 | 32.89 |
| 44465.270833333336 | 32.88 |
| 44465.28125 | 32.9 |
| 44465.291666666664 | 32.91 |
| 44465.302083333336 | 32.91 |
| 44465.3125 | 32.87 |
| 44465.322916666664 | 32.83 |
| 44465.333333333336 | 32.85 |
| 44465.34375 | 32.81 |
| 44465.354166666664 | 32.8 |
| 44465.364583333336 | 32.78 |
| 44465.375 | 32.75 |
| 44465.385416666664 | 32.73 |
| 44465.395833333336 | 32.68 |
| 44465.40625 | 32.63 |
| 44465.416666666664 | 32.63 |
| 44465.427083333336 | 32.63 |
| 44465.4375 | 32.63 |
| 44465.447916666664 | 32.64 |
| 44465.458333333336 | 32.66 |
| 44465.46875 | 32.68 |
| 44465.479166666664 | 32.66 |
| 44465.489583333336 | 32.65 |
| 44465.5 | 32.68 |
| 44465.510416666664 | 32.72 |
| 44465.520833333336 | 32.74 |
| 44465.53125 | 32.79 |
| 44465.541666666664 | 32.82 |
| 44465.552083333336 | 32.84 |
| 44465.5625 | 32.86 |
| 44465.572916666664 | 32.86 |
| 44465.583333333336 | 32.87 |
| 44465.59375 | 32.89 |
| 44465.604166666664 | 32.9 |
| 44465.614583333336 | 32.91 |
| 44465.625 | 32.91 |
| 44465.635416666664 | 32.92 |
| 44465.645833333336 | 32.93 |
| 44465.65625 | 32.94 |
| 44465.666666666664 | 32.94 |
| 44465.677083333336 | 32.94 |
| 44465.6875 | 32.93 |
| 44465.697916666664 | 32.92 |
| 44465.708333333336 | 32.91 |
| 44465.71875 | 32.9 |
| 44465.729166666664 | 32.9 |
| 44465.739583333336 | 32.92 |
| 44465.75 | 32.93 |
| 44465.760416666664 | 32.94 |
| 44465.770833333336 | 32.94 |
| 44465.78125 | 32.96 |
| 44465.791666666664 | 32.95 |
| 44465.802083333336 | 32.96 |
| 44465.8125 | 32.97 |
| 44465.822916666664 | 32.97 |
| 44465.833333333336 | 32.98 |
| 44465.84375 | 33 |
| 44465.854166666664 | 32.99 |
| 44465.864583333336 | 32.98 |
| 44465.875 | 32.98 |
| 44465.885416666664 | 32.95 |
| 44465.895833333336 | 32.94 |
| 44465.90625 | 32.92 |
| 44465.916666666664 | 32.9 |
| 44465.927083333336 | 32.91 |
| 44465.9375 | 32.87 |
| 44465.947916666664 | 32.85 |
| 44465.958333333336 | 32.81 |
| 44465.96875 | 32.85 |
| 44465.979166666664 | 32.83 |
| 44465.989583333336 | 32.81 |
| 44466.0 | 32.84 |
| 44466.010416666664 | 32.83 |
| 44466.020833333336 | 32.83 |
| 44466.03125 | 32.81 |
| 44466.041666666664 | 32.81 |
| 44466.052083333336 | 32.82 |
| 44466.0625 | 32.88 |
| 44466.072916666664 | 32.89 |
| 44466.083333333336 | 32.93 |
| 44466.09375 | 32.93 |
| 44466.104166666664 | 32.93 |
| 44466.114583333336 | 32.93 |
| 44466.125 | 32.93 |
| 44466.135416666664 | 32.95 |
| 44466.145833333336 | 32.96 |
| 44466.15625 | 32.97 |
| 44466.166666666664 | 32.98 |
| 44466.177083333336 | 32.98 |
| 44466.1875 | 32.99 |
| 44466.197916666664 | 32.99 |
| 44466.208333333336 | 32.99 |
| 44466.21875 | 32.94 |
| 44466.229166666664 | 32.93 |
| 44466.239583333336 | 32.94 |
| 44466.25 | 32.95 |
| 44466.260416666664 | 32.99 |
| 44466.270833333336 | 32.98 |
| 44466.28125 | 33.06 |
| 44466.291666666664 | 32.98 |
| 44466.302083333336 | 33 |
| 44466.3125 | 33 |
| 44466.322916666664 | 32.97 |
| 44466.333333333336 | 32.95 |
| 44466.34375 | 32.94 |
| 44466.354166666664 | 32.91 |
| 44466.364583333336 | 32.89 |
| 44466.375 | 32.83 |
| 44466.385416666664 | 32.82 |
| 44466.395833333336 | 32.8 |
| 44466.40625 | 32.81 |
| 44466.416666666664 | 32.8 |
| 44466.427083333336 | 32.78 |
| 44466.4375 | 32.78 |
| 44466.447916666664 | 32.75 |
| 44466.458333333336 | 32.77 |
| 44466.46875 | 32.76 |
| 44466.479166666664 | 32.75 |
| 44466.489583333336 | 32.75 |
| 44466.5 | 32.76 |
| 44466.510416666664 | 32.77 |
| 44466.520833333336 | 32.75 |
| 44466.53125 | 32.77 |
| 44466.541666666664 | 32.79 |
| 44466.552083333336 | 32.83 |
| 44466.5625 | 32.87 |
| 44466.572916666664 | 32.91 |
| 44466.583333333336 | 32.94 |
| 44466.59375 | 32.94 |
| 44466.604166666664 | 32.96 |
| 44466.614583333336 | 32.97 |
| 44466.625 | 32.98 |
| 44466.635416666664 | 32.99 |
| 44466.645833333336 | 33.01 |
| 44466.65625 | 33 |
| 44466.666666666664 | 33 |
| 44466.677083333336 | 33.01 |
| 44466.6875 | 33 |
| 44466.697916666664 | 32.97 |
| 44466.708333333336 | 32.97 |
| 44466.71875 | 32.95 |
| 44466.729166666664 | 32.94 |
| 44466.739583333336 | 32.94 |
| 44466.75 | 32.93 |
| 44466.760416666664 | 32.93 |
| 44466.770833333336 | 32.91 |
| 44466.78125 | 32.96 |
| 44466.791666666664 | 33.01 |
| 44466.802083333336 | 33.06 |
| 44466.8125 | 33.05 |
| 44466.822916666664 | 33.08 |
| 44466.833333333336 | 33.04 |
| 44466.84375 | 32.98 |
| 44466.854166666664 | 33.02 |
| 44466.864583333336 | 33.08 |
| 44466.875 | 33.08 |
| 44466.885416666664 | 33.07 |
| 44466.895833333336 | 33.05 |
| 44466.90625 | 33.03 |
| 44466.916666666664 | 33.03 |
| 44466.927083333336 | 33.01 |
| 44466.9375 | 32.99 |
| 44466.947916666664 | 32.99 |
| 44466.958333333336 | 32.97 |
| 44466.96875 | 32.93 |
| 44466.979166666664 | 32.89 |
| 44466.989583333336 | 32.87 |
| 44467.0 | 32.86 |
| 44467.010416666664 | 32.86 |
| 44467.020833333336 | 32.86 |
| 44467.03125 | 32.89 |
| 44467.041666666664 | 32.9 |
| 44467.052083333336 | 32.9 |
| 44467.0625 | 32.9 |
| 44467.072916666664 | 32.9 |
| 44467.083333333336 | 32.91 |
| 44467.09375 | 32.92 |
| 44467.104166666664 | 32.94 |
| 44467.114583333336 | 32.97 |
| 44467.125 | 33 |
| 44467.135416666664 | 33.02 |
| 44467.145833333336 | 33.03 |
| 44467.15625 | 33.05 |
| 44467.166666666664 | 33.06 |
| 44467.177083333336 | 33.07 |
| 44467.1875 | 33.07 |
| 44467.197916666664 | 33.07 |
| 44467.208333333336 | 33.07 |
| 44467.21875 | 33.08 |
| 44467.229166666664 | 33.07 |
| 44467.239583333336 | 33.02 |
| 44467.25 | 33.04 |
| 44467.260416666664 | 33.04 |
| 44467.270833333336 | 33.03 |
| 44467.28125 | 33.06 |
| 44467.291666666664 | 33.1 |
| 44467.302083333336 | 33.09 |
| 44467.3125 | 33.08 |
| 44467.322916666664 | 33.08 |
| 44467.333333333336 | 33.07 |
| 44467.34375 | 33.06 |
| 44467.354166666664 | 33.03 |
| 44467.364583333336 | 32.98 |
| 44467.375 | 32.92 |
| 44467.385416666664 | 32.88 |
| 44467.395833333336 | 32.87 |
| 44467.40625 | 32.84 |
| 44467.416666666664 | 32.79 |
| 44467.427083333336 | 32.77 |
| 44467.4375 | 32.77 |
| 44467.447916666664 | 32.74 |
| 44467.458333333336 | 32.73 |
| 44467.46875 | 32.68 |
| 44467.479166666664 | 32.67 |
| 44467.489583333336 | 32.68 |
| 44467.5 | 32.67 |
| 44467.510416666664 | 32.67 |
| 44467.520833333336 | 32.72 |
| 44467.53125 | 32.72 |
| 44467.541666666664 | 32.7 |
| 44467.552083333336 | 32.71 |
| 44467.5625 | 32.75 |
| 44467.572916666664 | 32.78 |
| 44467.583333333336 | 32.81 |
| 44467.59375 | 32.87 |
| 44467.604166666664 | 32.92 |
| 44467.614583333336 | 32.97 |
| 44467.625 | 33 |
| 44467.635416666664 | 33.03 |
| 44467.645833333336 | 33.04 |
| 44467.65625 | 33.06 |
| 44467.666666666664 | 33.09 |
| 44467.677083333336 | 33.09 |
| 44467.6875 | 33.11 |
| 44467.697916666664 | 33.11 |
| 44467.708333333336 | 33.12 |
| 44467.71875 | 33.12 |
| 44467.729166666664 | 33.13 |
| 44467.739583333336 | 33.14 |
| 44467.75 | 33.13 |
| 44467.760416666664 | 33.15 |
| 44467.770833333336 | 33.16 |
| 44467.78125 | 33.15 |
| 44467.791666666664 | 33.11 |
| 44467.802083333336 | 33.05 |
| 44467.8125 | 33.09 |
| 44467.822916666664 | 33.14 |
| 44467.833333333336 | 33.18 |
| 44467.84375 | 33.18 |
| 44467.854166666664 | 33.28 |
| 44467.864583333336 | 33.14 |
| 44467.875 | 33.16 |
| 44467.885416666664 | 33.15 |
| 44467.895833333336 | 33.16 |
| 44467.90625 | 33.15 |
| 44467.916666666664 | 33.13 |
| 44467.927083333336 | 33.1 |
| 44467.9375 | 33.13 |
| 44467.947916666664 | 33.05 |
| 44467.958333333336 | 33.02 |
| 44467.96875 | 33.02 |
| 44467.979166666664 | 32.97 |
| 44467.989583333336 | 32.9 |
| 44468.0 | 32.86 |
| 44468.010416666664 | 32.83 |
| 44468.020833333336 | 32.8 |
| 44468.03125 | 32.78 |
| 44468.041666666664 | 32.78 |
| 44468.052083333336 | 32.76 |
| 44468.0625 | 32.81 |
| 44468.072916666664 | 32.83 |
| 44468.083333333336 | 32.83 |
| 44468.09375 | 32.83 |
| 44468.104166666664 | 32.87 |
| 44468.114583333336 | 32.91 |
| 44468.125 | 32.91 |
| 44468.135416666664 | 32.93 |
| 44468.145833333336 | 32.96 |
| 44468.15625 | 32.98 |
| 44468.166666666664 | 32.99 |
| 44468.177083333336 | 32.98 |
| 44468.1875 | 32.98 |
| 44468.197916666664 | 32.98 |
| 44468.208333333336 | 32.98 |
| 44468.21875 | 32.96 |
| 44468.229166666664 | 32.97 |
| 44468.239583333336 | 32.96 |
| 44468.25 | 32.96 |
| 44468.260416666664 | 32.96 |
| 44468.270833333336 | 32.96 |
| 44468.28125 | 32.95 |
| 44468.291666666664 | 32.96 |
| 44468.302083333336 | 32.95 |
| 44468.3125 | 32.95 |
| 44468.322916666664 | 32.94 |
| 44468.333333333336 | 32.93 |
| 44468.34375 | 32.9 |
| 44468.354166666664 | 32.9 |
| 44468.364583333336 | 32.86 |
| 44468.375 | 32.87 |
| 44468.385416666664 | 32.88 |
| 44468.395833333336 | 32.86 |
| 44468.40625 | 32.88 |
| 44468.416666666664 | 32.89 |
| 44468.427083333336 | 32.91 |
| 44468.4375 | 32.96 |
| 44468.447916666664 | 32.91 |
| 44468.458333333336 | 32.93 |
| 44468.46875 | 32.91 |
| 44468.479166666664 | 32.93 |
| 44468.489583333336 | 32.92 |
| 44468.5 | 32.9 |
| 44468.510416666664 | 32.9 |
| 44468.520833333336 | 32.89 |
| 44468.53125 | 32.87 |
| 44468.541666666664 | 32.88 |
| 44468.552083333336 | 32.89 |
| 44468.5625 | 32.9 |
| 44468.572916666664 | 32.9 |
| 44468.583333333336 | 32.9 |
| 44468.59375 | 32.9 |
| 44468.604166666664 | 32.91 |
| 44468.614583333336 | 32.92 |
| 44468.625 | 32.94 |
| 44468.635416666664 | 32.94 |
| 44468.645833333336 | 32.94 |
| 44468.65625 | 32.94 |
| 44468.666666666664 | 32.95 |
| 44468.677083333336 | 32.97 |
| 44468.6875 | 32.97 |
| 44468.697916666664 | 32.97 |
| 44468.708333333336 | 32.97 |
| 44468.71875 | 32.97 |
| 44468.729166666664 | 32.97 |
| 44468.739583333336 | 32.98 |
| 44468.75 | 33 |
| 44468.760416666664 | 33.01 |
| 44468.770833333336 | 33.02 |
| 44468.78125 | 33.03 |
| 44468.791666666664 | 33.03 |
| 44468.802083333336 | 33.03 |
| 44468.8125 | 33.02 |
| 44468.822916666664 | 33.01 |
| 44468.833333333336 | 32.99 |
| 44468.84375 | 33 |
| 44468.854166666664 | 33.02 |
| 44468.864583333336 | 33.03 |
| 44468.875 | 33.03 |
| 44468.885416666664 | 33.04 |
| 44468.895833333336 | 33.04 |
| 44468.90625 | 33.04 |
| 44468.916666666664 | 33.04 |
| 44468.927083333336 | 33.06 |
| 44468.9375 | 33.06 |
| 44468.947916666664 | 33.05 |
| 44468.958333333336 | 33.08 |
| 44468.96875 | 33.1 |
| 44468.979166666664 | 33.08 |
| 44468.989583333336 | 33.11 |
| 44469.0 | 33.11 |
| 44469.010416666664 | 33.13 |
| 44469.020833333336 | 33.12 |
| 44469.03125 | 33.11 |
| 44469.041666666664 | 33.08 |
| 44469.052083333336 | 33.05 |
| 44469.0625 | 33.05 |
| 44469.072916666664 | 33.04 |
| 44469.083333333336 | 33.04 |
| 44469.09375 | 33.03 |
| 44469.104166666664 | 33.03 |
| 44469.114583333336 | 33.04 |
| 44469.125 | 33.03 |
| 44469.135416666664 | 33.03 |
| 44469.145833333336 | 33.03 |
| 44469.15625 | 33.04 |
| 44469.166666666664 | 33.05 |
| 44469.177083333336 | 33.05 |
| 44469.1875 | 33.05 |
| 44469.197916666664 | 33.03 |
| 44469.208333333336 | 33.03 |
| 44469.21875 | 33.04 |
| 44469.229166666664 | 33.05 |
| 44469.239583333336 | 33.05 |
| 44469.25 | 33.05 |
| 44469.260416666664 | 33.05 |
| 44469.270833333336 | 33.05 |
| 44469.28125 | 33.06 |
| 44469.291666666664 | 33.06 |
| 44469.302083333336 | 33.05 |
| 44469.3125 | 33.06 |
| 44469.322916666664 | 33.06 |
| 44469.333333333336 | 33.05 |
| 44469.34375 | 33.05 |
| 44469.354166666664 | 33.04 |
| 44469.364583333336 | 33.06 |
| 44469.375 | 33.05 |
| 44469.385416666664 | 33.05 |
| 44469.395833333336 | 33.06 |
| 44469.40625 | 33.06 |
| 44469.416666666664 | 33.07 |
| 44469.427083333336 | 33.07 |
| 44469.4375 | 33.07 |
| 44469.447916666664 | 33.07 |
| 44469.458333333336 | 33.05 |
| 44469.46875 | 33.02 |
| 44469.479166666664 | 33.07 |
| 44469.489583333336 | 33.06 |
| 44469.5 | 33.06 |
| 44469.510416666664 | 33.07 |
| 44469.520833333336 | 33.05 |
| 44469.53125 | 33.01 |
| 44469.541666666664 | 32.94 |
| 44469.552083333336 | 32.9 |
| 44469.5625 | 32.93 |
| 44469.572916666664 | 32.93 |
| 44469.583333333336 | 32.86 |
| 44469.59375 | 32.96 |
| 44469.604166666664 | 32.95 |
| 44469.614583333336 | 32.96 |
| 44469.625 | 32.97 |
| 44469.635416666664 | 33 |
| 44469.645833333336 | 33.01 |
| 44469.65625 | 33.03 |
| 44469.666666666664 | 33.06 |
| 44469.677083333336 | 33.07 |
| 44469.6875 | 33.07 |
| 44469.697916666664 | 33.07 |
| 44469.708333333336 | 33.07 |
| 44469.71875 | 33.08 |
| 44469.729166666664 | 33.09 |
| 44469.739583333336 | 33.07 |
| 44469.75 | 33.1 |
| 44469.760416666664 | 33.09 |
| 44469.770833333336 | 33.1 |
| 44469.78125 | 33.09 |
| 44469.791666666664 | 33.09 |
| 44469.802083333336 | 33.08 |
| 44469.8125 | 33.06 |
| 44469.822916666664 | 33.02 |
| 44469.833333333336 | 33 |
| 44469.84375 | 32.98 |
| 44469.854166666664 | 32.97 |
| 44469.864583333336 | 32.94 |
| 44469.875 | 32.92 |
| 44469.885416666664 | 32.93 |
| 44469.895833333336 | 32.98 |
| 44469.90625 | 33.03 |
| 44469.916666666664 | 33.09 |
| 44469.927083333336 | 33.1 |
| 44469.9375 | 33.12 |
| 44469.947916666664 | 33.15 |
| 44469.958333333336 | 33.17 |
| 44469.96875 | 33.17 |
| 44469.979166666664 | 33.19 |
| 44469.989583333336 | 33.22 |
| 44470.0 | 33.22 |
| 44470.010416666664 | 33.23 |
| 44470.020833333336 | 33.24 |
| 44470.03125 | 33.17 |
| 44470.041666666664 | 33.23 |
| 44470.052083333336 | 33.18 |
| 44470.0625 | 33.2 |
| 44470.072916666664 | 33.18 |
| 44470.083333333336 | 33.15 |
| 44470.09375 | 33.12 |
| 44470.104166666664 | 33.1 |
| 44470.114583333336 | 33.06 |
| 44470.125 | 33.06 |
| 44470.135416666664 | 33.11 |
| 44470.145833333336 | 33.1 |
| 44470.15625 | 33.09 |